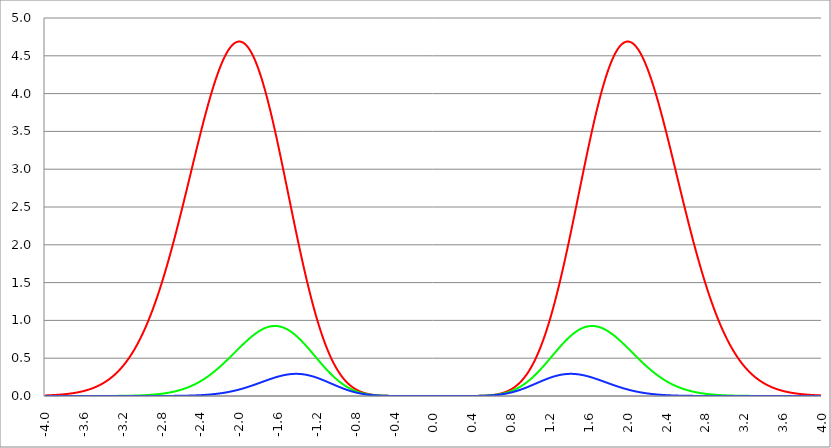
| Category | Series 1 | Series 0 | Series 2 |
|---|---|---|---|
| -4.0 | 0.007 | 0 | 0 |
| -3.996 | 0.008 | 0 | 0 |
| -3.992 | 0.008 | 0 | 0 |
| -3.988 | 0.008 | 0 | 0 |
| -3.984 | 0.008 | 0 | 0 |
| -3.98 | 0.008 | 0 | 0 |
| -3.976 | 0.009 | 0 | 0 |
| -3.972 | 0.009 | 0 | 0 |
| -3.968 | 0.009 | 0 | 0 |
| -3.964 | 0.009 | 0 | 0 |
| -3.96 | 0.009 | 0 | 0 |
| -3.956 | 0.01 | 0 | 0 |
| -3.952 | 0.01 | 0 | 0 |
| -3.948 | 0.01 | 0 | 0 |
| -3.944 | 0.01 | 0 | 0 |
| -3.94 | 0.011 | 0 | 0 |
| -3.936 | 0.011 | 0 | 0 |
| -3.932 | 0.011 | 0 | 0 |
| -3.928 | 0.011 | 0 | 0 |
| -3.924 | 0.012 | 0 | 0 |
| -3.92 | 0.012 | 0 | 0 |
| -3.916 | 0.012 | 0 | 0 |
| -3.912 | 0.012 | 0 | 0 |
| -3.908 | 0.013 | 0 | 0 |
| -3.904 | 0.013 | 0 | 0 |
| -3.9 | 0.013 | 0 | 0 |
| -3.896 | 0.014 | 0 | 0 |
| -3.892 | 0.014 | 0 | 0 |
| -3.888 | 0.014 | 0 | 0 |
| -3.884 | 0.015 | 0 | 0 |
| -3.88 | 0.015 | 0 | 0 |
| -3.876 | 0.015 | 0 | 0 |
| -3.872 | 0.016 | 0 | 0 |
| -3.868 | 0.016 | 0 | 0 |
| -3.864 | 0.016 | 0 | 0 |
| -3.86 | 0.017 | 0 | 0 |
| -3.856 | 0.017 | 0 | 0 |
| -3.852 | 0.017 | 0 | 0 |
| -3.848 | 0.018 | 0 | 0 |
| -3.844 | 0.018 | 0 | 0 |
| -3.84 | 0.019 | 0 | 0 |
| -3.836 | 0.019 | 0 | 0 |
| -3.832 | 0.02 | 0 | 0 |
| -3.828 | 0.02 | 0 | 0 |
| -3.824 | 0.02 | 0 | 0 |
| -3.82 | 0.021 | 0 | 0 |
| -3.816 | 0.021 | 0 | 0 |
| -3.812 | 0.022 | 0 | 0 |
| -3.808 | 0.022 | 0 | 0 |
| -3.804 | 0.023 | 0 | 0 |
| -3.8 | 0.023 | 0 | 0 |
| -3.796 | 0.024 | 0 | 0 |
| -3.792 | 0.024 | 0 | 0 |
| -3.788 | 0.025 | 0 | 0 |
| -3.784 | 0.025 | 0 | 0 |
| -3.78 | 0.026 | 0 | 0 |
| -3.776 | 0.027 | 0 | 0 |
| -3.772 | 0.027 | 0 | 0 |
| -3.768 | 0.028 | 0 | 0 |
| -3.764 | 0.028 | 0 | 0 |
| -3.76 | 0.029 | 0 | 0 |
| -3.756 | 0.03 | 0 | 0 |
| -3.752 | 0.03 | 0 | 0 |
| -3.748 | 0.031 | 0 | 0 |
| -3.744 | 0.032 | 0 | 0 |
| -3.74 | 0.032 | 0 | 0 |
| -3.736 | 0.033 | 0 | 0 |
| -3.732 | 0.034 | 0 | 0 |
| -3.728 | 0.034 | 0 | 0 |
| -3.724 | 0.035 | 0 | 0 |
| -3.72 | 0.036 | 0 | 0 |
| -3.716 | 0.037 | 0 | 0 |
| -3.712 | 0.037 | 0 | 0 |
| -3.708 | 0.038 | 0 | 0 |
| -3.704 | 0.039 | 0 | 0 |
| -3.7 | 0.04 | 0 | 0 |
| -3.696 | 0.041 | 0 | 0 |
| -3.692 | 0.042 | 0 | 0 |
| -3.688 | 0.042 | 0 | 0 |
| -3.684 | 0.043 | 0 | 0 |
| -3.68 | 0.044 | 0 | 0 |
| -3.676 | 0.045 | 0 | 0 |
| -3.672 | 0.046 | 0 | 0 |
| -3.668 | 0.047 | 0 | 0 |
| -3.664 | 0.048 | 0 | 0 |
| -3.66 | 0.049 | 0 | 0 |
| -3.656 | 0.05 | 0 | 0 |
| -3.652 | 0.051 | 0 | 0 |
| -3.648 | 0.052 | 0 | 0 |
| -3.644 | 0.053 | 0 | 0 |
| -3.64 | 0.054 | 0 | 0 |
| -3.636 | 0.055 | 0 | 0 |
| -3.632 | 0.057 | 0 | 0 |
| -3.628 | 0.058 | 0 | 0 |
| -3.624 | 0.059 | 0 | 0 |
| -3.62 | 0.06 | 0 | 0 |
| -3.616 | 0.061 | 0 | 0 |
| -3.612 | 0.063 | 0 | 0 |
| -3.608 | 0.064 | 0 | 0 |
| -3.604 | 0.065 | 0 | 0 |
| -3.6 | 0.066 | 0 | 0 |
| -3.596 | 0.068 | 0 | 0 |
| -3.592 | 0.069 | 0 | 0 |
| -3.588 | 0.07 | 0 | 0 |
| -3.584 | 0.072 | 0 | 0 |
| -3.58 | 0.073 | 0 | 0 |
| -3.576 | 0.075 | 0 | 0 |
| -3.572 | 0.076 | 0 | 0 |
| -3.568 | 0.078 | 0 | 0 |
| -3.564 | 0.079 | 0 | 0 |
| -3.56 | 0.081 | 0 | 0 |
| -3.556 | 0.082 | 0 | 0 |
| -3.552 | 0.084 | 0 | 0 |
| -3.548 | 0.086 | 0 | 0 |
| -3.544 | 0.087 | 0 | 0 |
| -3.54 | 0.089 | 0 | 0 |
| -3.536 | 0.091 | 0 | 0 |
| -3.532 | 0.093 | 0 | 0 |
| -3.528 | 0.094 | 0 | 0 |
| -3.524 | 0.096 | 0 | 0 |
| -3.52 | 0.098 | 0 | 0 |
| -3.516 | 0.1 | 0 | 0 |
| -3.512 | 0.102 | 0 | 0 |
| -3.508 | 0.104 | 0 | 0 |
| -3.504 | 0.106 | 0 | 0 |
| -3.5 | 0.108 | 0 | 0 |
| -3.496 | 0.11 | 0 | 0 |
| -3.492 | 0.112 | 0 | 0 |
| -3.488 | 0.114 | 0 | 0 |
| -3.484 | 0.116 | 0 | 0 |
| -3.48 | 0.118 | 0 | 0 |
| -3.476 | 0.121 | 0 | 0 |
| -3.472 | 0.123 | 0 | 0 |
| -3.467999999999999 | 0.125 | 0 | 0 |
| -3.463999999999999 | 0.127 | 0 | 0 |
| -3.459999999999999 | 0.13 | 0 | 0 |
| -3.455999999999999 | 0.132 | 0 | 0 |
| -3.451999999999999 | 0.135 | 0 | 0 |
| -3.447999999999999 | 0.137 | 0 | 0 |
| -3.443999999999999 | 0.14 | 0 | 0 |
| -3.439999999999999 | 0.142 | 0 | 0 |
| -3.435999999999999 | 0.145 | 0 | 0 |
| -3.431999999999999 | 0.148 | 0 | 0 |
| -3.427999999999999 | 0.15 | 0 | 0 |
| -3.423999999999999 | 0.153 | 0 | 0 |
| -3.419999999999999 | 0.156 | 0 | 0 |
| -3.415999999999999 | 0.159 | 0 | 0 |
| -3.411999999999999 | 0.161 | 0 | 0 |
| -3.407999999999999 | 0.164 | 0 | 0 |
| -3.403999999999999 | 0.167 | 0.001 | 0 |
| -3.399999999999999 | 0.17 | 0.001 | 0 |
| -3.395999999999999 | 0.173 | 0.001 | 0 |
| -3.391999999999999 | 0.177 | 0.001 | 0 |
| -3.387999999999999 | 0.18 | 0.001 | 0 |
| -3.383999999999999 | 0.183 | 0.001 | 0 |
| -3.379999999999999 | 0.186 | 0.001 | 0 |
| -3.375999999999999 | 0.189 | 0.001 | 0 |
| -3.371999999999999 | 0.193 | 0.001 | 0 |
| -3.367999999999999 | 0.196 | 0.001 | 0 |
| -3.363999999999999 | 0.2 | 0.001 | 0 |
| -3.359999999999999 | 0.203 | 0.001 | 0 |
| -3.355999999999999 | 0.207 | 0.001 | 0 |
| -3.351999999999999 | 0.21 | 0.001 | 0 |
| -3.347999999999999 | 0.214 | 0.001 | 0 |
| -3.343999999999999 | 0.218 | 0.001 | 0 |
| -3.339999999999999 | 0.221 | 0.001 | 0 |
| -3.335999999999999 | 0.225 | 0.001 | 0 |
| -3.331999999999999 | 0.229 | 0.001 | 0 |
| -3.327999999999999 | 0.233 | 0.001 | 0 |
| -3.323999999999999 | 0.237 | 0.001 | 0 |
| -3.319999999999999 | 0.241 | 0.001 | 0 |
| -3.315999999999999 | 0.245 | 0.001 | 0 |
| -3.311999999999999 | 0.249 | 0.001 | 0 |
| -3.307999999999999 | 0.254 | 0.001 | 0 |
| -3.303999999999999 | 0.258 | 0.001 | 0 |
| -3.299999999999999 | 0.262 | 0.001 | 0 |
| -3.295999999999999 | 0.267 | 0.001 | 0 |
| -3.291999999999999 | 0.271 | 0.001 | 0 |
| -3.288 | 0.276 | 0.001 | 0 |
| -3.284 | 0.28 | 0.001 | 0 |
| -3.279999999999999 | 0.285 | 0.001 | 0 |
| -3.275999999999999 | 0.29 | 0.001 | 0 |
| -3.271999999999999 | 0.294 | 0.001 | 0 |
| -3.268 | 0.299 | 0.001 | 0 |
| -3.264 | 0.304 | 0.001 | 0 |
| -3.259999999999999 | 0.309 | 0.002 | 0 |
| -3.255999999999999 | 0.314 | 0.002 | 0 |
| -3.251999999999999 | 0.319 | 0.002 | 0 |
| -3.248 | 0.325 | 0.002 | 0 |
| -3.244 | 0.33 | 0.002 | 0 |
| -3.239999999999999 | 0.335 | 0.002 | 0 |
| -3.235999999999999 | 0.341 | 0.002 | 0 |
| -3.231999999999999 | 0.346 | 0.002 | 0 |
| -3.228 | 0.352 | 0.002 | 0 |
| -3.224 | 0.357 | 0.002 | 0 |
| -3.219999999999999 | 0.363 | 0.002 | 0 |
| -3.215999999999999 | 0.369 | 0.002 | 0 |
| -3.211999999999999 | 0.375 | 0.002 | 0 |
| -3.208 | 0.381 | 0.002 | 0 |
| -3.204 | 0.387 | 0.002 | 0 |
| -3.199999999999999 | 0.393 | 0.002 | 0 |
| -3.195999999999999 | 0.399 | 0.002 | 0 |
| -3.191999999999999 | 0.405 | 0.002 | 0 |
| -3.188 | 0.411 | 0.003 | 0 |
| -3.184 | 0.418 | 0.003 | 0 |
| -3.179999999999999 | 0.424 | 0.003 | 0 |
| -3.175999999999999 | 0.431 | 0.003 | 0 |
| -3.171999999999999 | 0.437 | 0.003 | 0 |
| -3.168 | 0.444 | 0.003 | 0 |
| -3.164 | 0.451 | 0.003 | 0 |
| -3.159999999999999 | 0.458 | 0.003 | 0 |
| -3.155999999999999 | 0.465 | 0.003 | 0 |
| -3.151999999999999 | 0.472 | 0.003 | 0 |
| -3.148 | 0.479 | 0.003 | 0 |
| -3.144 | 0.486 | 0.003 | 0 |
| -3.139999999999999 | 0.494 | 0.004 | 0 |
| -3.135999999999999 | 0.501 | 0.004 | 0 |
| -3.131999999999999 | 0.509 | 0.004 | 0 |
| -3.128 | 0.516 | 0.004 | 0 |
| -3.124 | 0.524 | 0.004 | 0 |
| -3.119999999999999 | 0.532 | 0.004 | 0 |
| -3.115999999999999 | 0.54 | 0.004 | 0 |
| -3.111999999999999 | 0.547 | 0.004 | 0 |
| -3.108 | 0.556 | 0.004 | 0 |
| -3.104 | 0.564 | 0.005 | 0 |
| -3.099999999999999 | 0.572 | 0.005 | 0 |
| -3.095999999999999 | 0.58 | 0.005 | 0 |
| -3.091999999999999 | 0.589 | 0.005 | 0 |
| -3.088 | 0.597 | 0.005 | 0 |
| -3.084 | 0.606 | 0.005 | 0 |
| -3.079999999999999 | 0.614 | 0.005 | 0 |
| -3.075999999999999 | 0.623 | 0.005 | 0 |
| -3.071999999999999 | 0.632 | 0.006 | 0 |
| -3.068 | 0.641 | 0.006 | 0 |
| -3.064 | 0.65 | 0.006 | 0 |
| -3.059999999999999 | 0.659 | 0.006 | 0 |
| -3.055999999999999 | 0.669 | 0.006 | 0 |
| -3.051999999999999 | 0.678 | 0.006 | 0 |
| -3.048 | 0.688 | 0.007 | 0 |
| -3.044 | 0.697 | 0.007 | 0 |
| -3.039999999999999 | 0.707 | 0.007 | 0 |
| -3.035999999999999 | 0.717 | 0.007 | 0 |
| -3.031999999999999 | 0.727 | 0.007 | 0 |
| -3.028 | 0.737 | 0.008 | 0 |
| -3.024 | 0.747 | 0.008 | 0 |
| -3.019999999999999 | 0.757 | 0.008 | 0 |
| -3.015999999999999 | 0.767 | 0.008 | 0 |
| -3.011999999999999 | 0.778 | 0.008 | 0 |
| -3.008 | 0.788 | 0.009 | 0 |
| -3.004 | 0.799 | 0.009 | 0 |
| -2.999999999999999 | 0.81 | 0.009 | 0 |
| -2.995999999999999 | 0.821 | 0.009 | 0 |
| -2.991999999999999 | 0.831 | 0.009 | 0 |
| -2.988 | 0.843 | 0.01 | 0 |
| -2.984 | 0.854 | 0.01 | 0 |
| -2.979999999999999 | 0.865 | 0.01 | 0 |
| -2.975999999999999 | 0.876 | 0.01 | 0 |
| -2.971999999999999 | 0.888 | 0.011 | 0 |
| -2.968 | 0.899 | 0.011 | 0 |
| -2.964 | 0.911 | 0.011 | 0 |
| -2.959999999999999 | 0.923 | 0.012 | 0 |
| -2.955999999999999 | 0.935 | 0.012 | 0 |
| -2.951999999999999 | 0.947 | 0.012 | 0 |
| -2.948 | 0.959 | 0.012 | 0 |
| -2.944 | 0.971 | 0.013 | 0 |
| -2.939999999999999 | 0.984 | 0.013 | 0 |
| -2.935999999999999 | 0.996 | 0.013 | 0 |
| -2.931999999999999 | 1.009 | 0.014 | 0 |
| -2.928 | 1.022 | 0.014 | 0 |
| -2.924 | 1.034 | 0.014 | 0 |
| -2.919999999999999 | 1.047 | 0.015 | 0 |
| -2.915999999999999 | 1.06 | 0.015 | 0 |
| -2.911999999999999 | 1.074 | 0.015 | 0 |
| -2.908 | 1.087 | 0.016 | 0 |
| -2.904 | 1.1 | 0.016 | 0 |
| -2.899999999999999 | 1.114 | 0.017 | 0 |
| -2.895999999999999 | 1.127 | 0.017 | 0 |
| -2.891999999999999 | 1.141 | 0.017 | 0 |
| -2.887999999999999 | 1.155 | 0.018 | 0 |
| -2.883999999999999 | 1.169 | 0.018 | 0 |
| -2.879999999999999 | 1.183 | 0.019 | 0 |
| -2.875999999999999 | 1.197 | 0.019 | 0 |
| -2.871999999999999 | 1.211 | 0.02 | 0 |
| -2.867999999999999 | 1.226 | 0.02 | 0 |
| -2.863999999999999 | 1.24 | 0.021 | 0 |
| -2.859999999999999 | 1.255 | 0.021 | 0 |
| -2.855999999999999 | 1.27 | 0.021 | 0 |
| -2.851999999999999 | 1.284 | 0.022 | 0 |
| -2.847999999999999 | 1.299 | 0.023 | 0 |
| -2.843999999999999 | 1.314 | 0.023 | 0 |
| -2.839999999999999 | 1.33 | 0.024 | 0 |
| -2.835999999999999 | 1.345 | 0.024 | 0 |
| -2.831999999999999 | 1.36 | 0.025 | 0 |
| -2.827999999999999 | 1.376 | 0.025 | 0 |
| -2.823999999999999 | 1.391 | 0.026 | 0 |
| -2.819999999999999 | 1.407 | 0.026 | 0 |
| -2.815999999999999 | 1.423 | 0.027 | 0.001 |
| -2.811999999999999 | 1.439 | 0.028 | 0.001 |
| -2.807999999999999 | 1.455 | 0.028 | 0.001 |
| -2.803999999999999 | 1.471 | 0.029 | 0.001 |
| -2.799999999999999 | 1.487 | 0.03 | 0.001 |
| -2.795999999999999 | 1.504 | 0.03 | 0.001 |
| -2.791999999999999 | 1.52 | 0.031 | 0.001 |
| -2.787999999999999 | 1.537 | 0.032 | 0.001 |
| -2.783999999999999 | 1.553 | 0.032 | 0.001 |
| -2.779999999999999 | 1.57 | 0.033 | 0.001 |
| -2.775999999999999 | 1.587 | 0.034 | 0.001 |
| -2.771999999999999 | 1.604 | 0.034 | 0.001 |
| -2.767999999999999 | 1.621 | 0.035 | 0.001 |
| -2.763999999999999 | 1.638 | 0.036 | 0.001 |
| -2.759999999999999 | 1.656 | 0.037 | 0.001 |
| -2.755999999999999 | 1.673 | 0.038 | 0.001 |
| -2.751999999999999 | 1.691 | 0.038 | 0.001 |
| -2.747999999999999 | 1.708 | 0.039 | 0.001 |
| -2.743999999999999 | 1.726 | 0.04 | 0.001 |
| -2.739999999999999 | 1.744 | 0.041 | 0.001 |
| -2.735999999999999 | 1.762 | 0.042 | 0.001 |
| -2.731999999999999 | 1.78 | 0.043 | 0.001 |
| -2.727999999999999 | 1.798 | 0.044 | 0.001 |
| -2.723999999999999 | 1.816 | 0.044 | 0.001 |
| -2.719999999999999 | 1.834 | 0.045 | 0.001 |
| -2.715999999999999 | 1.853 | 0.046 | 0.001 |
| -2.711999999999999 | 1.871 | 0.047 | 0.001 |
| -2.707999999999999 | 1.89 | 0.048 | 0.001 |
| -2.703999999999999 | 1.908 | 0.049 | 0.001 |
| -2.699999999999999 | 1.927 | 0.05 | 0.001 |
| -2.695999999999999 | 1.946 | 0.051 | 0.001 |
| -2.691999999999999 | 1.965 | 0.052 | 0.001 |
| -2.687999999999999 | 1.984 | 0.054 | 0.001 |
| -2.683999999999999 | 2.003 | 0.055 | 0.001 |
| -2.679999999999999 | 2.022 | 0.056 | 0.002 |
| -2.675999999999999 | 2.041 | 0.057 | 0.002 |
| -2.671999999999999 | 2.061 | 0.058 | 0.002 |
| -2.667999999999999 | 2.08 | 0.059 | 0.002 |
| -2.663999999999999 | 2.1 | 0.06 | 0.002 |
| -2.659999999999999 | 2.119 | 0.062 | 0.002 |
| -2.655999999999999 | 2.139 | 0.063 | 0.002 |
| -2.651999999999999 | 2.158 | 0.064 | 0.002 |
| -2.647999999999999 | 2.178 | 0.065 | 0.002 |
| -2.643999999999999 | 2.198 | 0.067 | 0.002 |
| -2.639999999999999 | 2.218 | 0.068 | 0.002 |
| -2.635999999999999 | 2.238 | 0.069 | 0.002 |
| -2.631999999999999 | 2.258 | 0.071 | 0.002 |
| -2.627999999999999 | 2.278 | 0.072 | 0.002 |
| -2.623999999999999 | 2.298 | 0.074 | 0.002 |
| -2.619999999999999 | 2.319 | 0.075 | 0.002 |
| -2.615999999999999 | 2.339 | 0.076 | 0.002 |
| -2.611999999999999 | 2.359 | 0.078 | 0.003 |
| -2.607999999999999 | 2.38 | 0.079 | 0.003 |
| -2.603999999999999 | 2.4 | 0.081 | 0.003 |
| -2.599999999999999 | 2.421 | 0.082 | 0.003 |
| -2.595999999999999 | 2.441 | 0.084 | 0.003 |
| -2.591999999999999 | 2.462 | 0.086 | 0.003 |
| -2.587999999999999 | 2.483 | 0.087 | 0.003 |
| -2.583999999999999 | 2.503 | 0.089 | 0.003 |
| -2.579999999999999 | 2.524 | 0.091 | 0.003 |
| -2.575999999999999 | 2.545 | 0.092 | 0.003 |
| -2.571999999999999 | 2.566 | 0.094 | 0.003 |
| -2.567999999999999 | 2.587 | 0.096 | 0.004 |
| -2.563999999999999 | 2.608 | 0.097 | 0.004 |
| -2.559999999999999 | 2.629 | 0.099 | 0.004 |
| -2.555999999999999 | 2.65 | 0.101 | 0.004 |
| -2.551999999999999 | 2.671 | 0.103 | 0.004 |
| -2.547999999999999 | 2.692 | 0.105 | 0.004 |
| -2.543999999999999 | 2.713 | 0.107 | 0.004 |
| -2.539999999999999 | 2.734 | 0.109 | 0.004 |
| -2.535999999999999 | 2.755 | 0.111 | 0.004 |
| -2.531999999999999 | 2.776 | 0.113 | 0.005 |
| -2.527999999999999 | 2.797 | 0.115 | 0.005 |
| -2.523999999999999 | 2.818 | 0.117 | 0.005 |
| -2.519999999999999 | 2.84 | 0.119 | 0.005 |
| -2.515999999999999 | 2.861 | 0.121 | 0.005 |
| -2.511999999999999 | 2.882 | 0.123 | 0.005 |
| -2.507999999999999 | 2.903 | 0.125 | 0.005 |
| -2.503999999999999 | 2.924 | 0.127 | 0.006 |
| -2.499999999999999 | 2.946 | 0.129 | 0.006 |
| -2.495999999999999 | 2.967 | 0.132 | 0.006 |
| -2.491999999999999 | 2.988 | 0.134 | 0.006 |
| -2.487999999999999 | 3.009 | 0.136 | 0.006 |
| -2.483999999999999 | 3.03 | 0.139 | 0.006 |
| -2.479999999999999 | 3.052 | 0.141 | 0.007 |
| -2.475999999999999 | 3.073 | 0.143 | 0.007 |
| -2.471999999999999 | 3.094 | 0.146 | 0.007 |
| -2.467999999999999 | 3.115 | 0.148 | 0.007 |
| -2.463999999999999 | 3.136 | 0.151 | 0.007 |
| -2.459999999999999 | 3.157 | 0.153 | 0.007 |
| -2.455999999999999 | 3.178 | 0.156 | 0.008 |
| -2.451999999999999 | 3.199 | 0.158 | 0.008 |
| -2.447999999999999 | 3.22 | 0.161 | 0.008 |
| -2.443999999999999 | 3.241 | 0.164 | 0.008 |
| -2.439999999999999 | 3.262 | 0.166 | 0.008 |
| -2.435999999999999 | 3.283 | 0.169 | 0.009 |
| -2.431999999999999 | 3.304 | 0.172 | 0.009 |
| -2.427999999999999 | 3.325 | 0.174 | 0.009 |
| -2.423999999999999 | 3.345 | 0.177 | 0.009 |
| -2.419999999999999 | 3.366 | 0.18 | 0.01 |
| -2.415999999999999 | 3.387 | 0.183 | 0.01 |
| -2.411999999999999 | 3.407 | 0.186 | 0.01 |
| -2.407999999999999 | 3.428 | 0.189 | 0.01 |
| -2.403999999999999 | 3.448 | 0.192 | 0.011 |
| -2.399999999999999 | 3.469 | 0.195 | 0.011 |
| -2.395999999999999 | 3.489 | 0.198 | 0.011 |
| -2.391999999999999 | 3.509 | 0.201 | 0.011 |
| -2.387999999999999 | 3.529 | 0.204 | 0.012 |
| -2.383999999999999 | 3.549 | 0.207 | 0.012 |
| -2.379999999999999 | 3.569 | 0.21 | 0.012 |
| -2.375999999999999 | 3.589 | 0.213 | 0.013 |
| -2.371999999999999 | 3.609 | 0.217 | 0.013 |
| -2.367999999999998 | 3.629 | 0.22 | 0.013 |
| -2.363999999999998 | 3.649 | 0.223 | 0.014 |
| -2.359999999999998 | 3.668 | 0.226 | 0.014 |
| -2.355999999999998 | 3.688 | 0.23 | 0.014 |
| -2.351999999999998 | 3.707 | 0.233 | 0.015 |
| -2.347999999999998 | 3.726 | 0.237 | 0.015 |
| -2.343999999999998 | 3.745 | 0.24 | 0.015 |
| -2.339999999999998 | 3.764 | 0.244 | 0.016 |
| -2.335999999999998 | 3.783 | 0.247 | 0.016 |
| -2.331999999999998 | 3.802 | 0.251 | 0.017 |
| -2.327999999999998 | 3.821 | 0.254 | 0.017 |
| -2.323999999999998 | 3.84 | 0.258 | 0.017 |
| -2.319999999999998 | 3.858 | 0.262 | 0.018 |
| -2.315999999999998 | 3.876 | 0.265 | 0.018 |
| -2.311999999999998 | 3.894 | 0.269 | 0.019 |
| -2.307999999999998 | 3.913 | 0.273 | 0.019 |
| -2.303999999999998 | 3.93 | 0.277 | 0.019 |
| -2.299999999999998 | 3.948 | 0.28 | 0.02 |
| -2.295999999999998 | 3.966 | 0.284 | 0.02 |
| -2.291999999999998 | 3.983 | 0.288 | 0.021 |
| -2.287999999999998 | 4.001 | 0.292 | 0.021 |
| -2.283999999999998 | 4.018 | 0.296 | 0.022 |
| -2.279999999999998 | 4.035 | 0.3 | 0.022 |
| -2.275999999999998 | 4.052 | 0.304 | 0.023 |
| -2.271999999999998 | 4.069 | 0.308 | 0.023 |
| -2.267999999999998 | 4.085 | 0.312 | 0.024 |
| -2.263999999999998 | 4.102 | 0.316 | 0.024 |
| -2.259999999999998 | 4.118 | 0.32 | 0.025 |
| -2.255999999999998 | 4.134 | 0.324 | 0.025 |
| -2.251999999999998 | 4.15 | 0.329 | 0.026 |
| -2.247999999999998 | 4.165 | 0.333 | 0.027 |
| -2.243999999999998 | 4.181 | 0.337 | 0.027 |
| -2.239999999999998 | 4.196 | 0.341 | 0.028 |
| -2.235999999999998 | 4.211 | 0.346 | 0.028 |
| -2.231999999999998 | 4.226 | 0.35 | 0.029 |
| -2.227999999999998 | 4.241 | 0.354 | 0.03 |
| -2.223999999999998 | 4.256 | 0.359 | 0.03 |
| -2.219999999999998 | 4.27 | 0.363 | 0.031 |
| -2.215999999999998 | 4.284 | 0.368 | 0.032 |
| -2.211999999999998 | 4.298 | 0.372 | 0.032 |
| -2.207999999999998 | 4.312 | 0.377 | 0.033 |
| -2.203999999999998 | 4.326 | 0.381 | 0.034 |
| -2.199999999999998 | 4.339 | 0.386 | 0.034 |
| -2.195999999999998 | 4.352 | 0.39 | 0.035 |
| -2.191999999999998 | 4.365 | 0.395 | 0.036 |
| -2.187999999999998 | 4.378 | 0.4 | 0.036 |
| -2.183999999999998 | 4.39 | 0.404 | 0.037 |
| -2.179999999999998 | 4.403 | 0.409 | 0.038 |
| -2.175999999999998 | 4.415 | 0.414 | 0.039 |
| -2.171999999999998 | 4.426 | 0.418 | 0.04 |
| -2.167999999999998 | 4.438 | 0.423 | 0.04 |
| -2.163999999999998 | 4.449 | 0.428 | 0.041 |
| -2.159999999999998 | 4.461 | 0.433 | 0.042 |
| -2.155999999999998 | 4.471 | 0.438 | 0.043 |
| -2.151999999999998 | 4.482 | 0.442 | 0.044 |
| -2.147999999999998 | 4.492 | 0.447 | 0.045 |
| -2.143999999999998 | 4.503 | 0.452 | 0.045 |
| -2.139999999999998 | 4.512 | 0.457 | 0.046 |
| -2.135999999999998 | 4.522 | 0.462 | 0.047 |
| -2.131999999999998 | 4.532 | 0.467 | 0.048 |
| -2.127999999999998 | 4.541 | 0.472 | 0.049 |
| -2.123999999999998 | 4.55 | 0.477 | 0.05 |
| -2.119999999999998 | 4.558 | 0.482 | 0.051 |
| -2.115999999999998 | 4.567 | 0.487 | 0.052 |
| -2.111999999999998 | 4.575 | 0.492 | 0.053 |
| -2.107999999999998 | 4.583 | 0.497 | 0.054 |
| -2.103999999999998 | 4.59 | 0.502 | 0.055 |
| -2.099999999999998 | 4.597 | 0.507 | 0.056 |
| -2.095999999999998 | 4.604 | 0.512 | 0.057 |
| -2.091999999999998 | 4.611 | 0.517 | 0.058 |
| -2.087999999999998 | 4.618 | 0.522 | 0.059 |
| -2.083999999999998 | 4.624 | 0.527 | 0.06 |
| -2.079999999999998 | 4.63 | 0.532 | 0.061 |
| -2.075999999999998 | 4.636 | 0.537 | 0.062 |
| -2.071999999999998 | 4.641 | 0.542 | 0.063 |
| -2.067999999999998 | 4.646 | 0.548 | 0.065 |
| -2.063999999999998 | 4.651 | 0.553 | 0.066 |
| -2.059999999999998 | 4.655 | 0.558 | 0.067 |
| -2.055999999999998 | 4.66 | 0.563 | 0.068 |
| -2.051999999999998 | 4.664 | 0.568 | 0.069 |
| -2.047999999999998 | 4.667 | 0.573 | 0.07 |
| -2.043999999999998 | 4.671 | 0.578 | 0.072 |
| -2.039999999999998 | 4.674 | 0.583 | 0.073 |
| -2.035999999999998 | 4.677 | 0.589 | 0.074 |
| -2.031999999999998 | 4.679 | 0.594 | 0.075 |
| -2.027999999999998 | 4.681 | 0.599 | 0.077 |
| -2.023999999999998 | 4.683 | 0.604 | 0.078 |
| -2.019999999999998 | 4.685 | 0.609 | 0.079 |
| -2.015999999999998 | 4.686 | 0.614 | 0.08 |
| -2.011999999999998 | 4.687 | 0.619 | 0.082 |
| -2.007999999999998 | 4.688 | 0.624 | 0.083 |
| -2.003999999999998 | 4.689 | 0.629 | 0.085 |
| -1.999999999999998 | 4.689 | 0.635 | 0.086 |
| -1.995999999999998 | 4.689 | 0.64 | 0.087 |
| -1.991999999999998 | 4.688 | 0.645 | 0.089 |
| -1.987999999999998 | 4.687 | 0.65 | 0.09 |
| -1.983999999999998 | 4.686 | 0.655 | 0.091 |
| -1.979999999999998 | 4.685 | 0.66 | 0.093 |
| -1.975999999999998 | 4.683 | 0.665 | 0.094 |
| -1.971999999999998 | 4.681 | 0.67 | 0.096 |
| -1.967999999999998 | 4.679 | 0.675 | 0.097 |
| -1.963999999999998 | 4.677 | 0.68 | 0.099 |
| -1.959999999999998 | 4.674 | 0.685 | 0.1 |
| -1.955999999999998 | 4.671 | 0.69 | 0.102 |
| -1.951999999999998 | 4.667 | 0.694 | 0.103 |
| -1.947999999999998 | 4.663 | 0.699 | 0.105 |
| -1.943999999999998 | 4.659 | 0.704 | 0.106 |
| -1.939999999999998 | 4.655 | 0.709 | 0.108 |
| -1.935999999999998 | 4.65 | 0.714 | 0.11 |
| -1.931999999999998 | 4.645 | 0.719 | 0.111 |
| -1.927999999999998 | 4.64 | 0.723 | 0.113 |
| -1.923999999999998 | 4.634 | 0.728 | 0.114 |
| -1.919999999999998 | 4.628 | 0.733 | 0.116 |
| -1.915999999999998 | 4.622 | 0.737 | 0.118 |
| -1.911999999999998 | 4.616 | 0.742 | 0.119 |
| -1.907999999999998 | 4.609 | 0.747 | 0.121 |
| -1.903999999999998 | 4.602 | 0.751 | 0.123 |
| -1.899999999999998 | 4.594 | 0.756 | 0.124 |
| -1.895999999999998 | 4.587 | 0.76 | 0.126 |
| -1.891999999999998 | 4.579 | 0.765 | 0.128 |
| -1.887999999999998 | 4.57 | 0.769 | 0.129 |
| -1.883999999999998 | 4.562 | 0.773 | 0.131 |
| -1.879999999999998 | 4.553 | 0.778 | 0.133 |
| -1.875999999999998 | 4.544 | 0.782 | 0.135 |
| -1.871999999999998 | 4.534 | 0.786 | 0.136 |
| -1.867999999999998 | 4.525 | 0.79 | 0.138 |
| -1.863999999999998 | 4.515 | 0.795 | 0.14 |
| -1.859999999999998 | 4.504 | 0.799 | 0.142 |
| -1.855999999999998 | 4.494 | 0.803 | 0.143 |
| -1.851999999999998 | 4.483 | 0.807 | 0.145 |
| -1.847999999999998 | 4.472 | 0.811 | 0.147 |
| -1.843999999999998 | 4.46 | 0.815 | 0.149 |
| -1.839999999999998 | 4.448 | 0.819 | 0.151 |
| -1.835999999999998 | 4.436 | 0.822 | 0.152 |
| -1.831999999999998 | 4.424 | 0.826 | 0.154 |
| -1.827999999999998 | 4.411 | 0.83 | 0.156 |
| -1.823999999999998 | 4.399 | 0.833 | 0.158 |
| -1.819999999999998 | 4.385 | 0.837 | 0.16 |
| -1.815999999999998 | 4.372 | 0.841 | 0.162 |
| -1.811999999999998 | 4.358 | 0.844 | 0.163 |
| -1.807999999999998 | 4.344 | 0.847 | 0.165 |
| -1.803999999999998 | 4.33 | 0.851 | 0.167 |
| -1.799999999999998 | 4.316 | 0.854 | 0.169 |
| -1.795999999999998 | 4.301 | 0.857 | 0.171 |
| -1.791999999999998 | 4.286 | 0.861 | 0.173 |
| -1.787999999999998 | 4.271 | 0.864 | 0.175 |
| -1.783999999999998 | 4.255 | 0.867 | 0.176 |
| -1.779999999999998 | 4.24 | 0.87 | 0.178 |
| -1.775999999999998 | 4.224 | 0.873 | 0.18 |
| -1.771999999999998 | 4.208 | 0.875 | 0.182 |
| -1.767999999999998 | 4.191 | 0.878 | 0.184 |
| -1.763999999999998 | 4.174 | 0.881 | 0.186 |
| -1.759999999999998 | 4.157 | 0.883 | 0.188 |
| -1.755999999999998 | 4.14 | 0.886 | 0.19 |
| -1.751999999999998 | 4.123 | 0.889 | 0.191 |
| -1.747999999999998 | 4.105 | 0.891 | 0.193 |
| -1.743999999999998 | 4.087 | 0.893 | 0.195 |
| -1.739999999999998 | 4.069 | 0.896 | 0.197 |
| -1.735999999999998 | 4.051 | 0.898 | 0.199 |
| -1.731999999999998 | 4.033 | 0.9 | 0.201 |
| -1.727999999999998 | 4.014 | 0.902 | 0.203 |
| -1.723999999999998 | 3.995 | 0.904 | 0.205 |
| -1.719999999999998 | 3.976 | 0.906 | 0.206 |
| -1.715999999999998 | 3.956 | 0.908 | 0.208 |
| -1.711999999999998 | 3.937 | 0.909 | 0.21 |
| -1.707999999999998 | 3.917 | 0.911 | 0.212 |
| -1.703999999999998 | 3.897 | 0.912 | 0.214 |
| -1.699999999999998 | 3.877 | 0.914 | 0.215 |
| -1.695999999999998 | 3.857 | 0.915 | 0.217 |
| -1.691999999999998 | 3.836 | 0.917 | 0.219 |
| -1.687999999999998 | 3.815 | 0.918 | 0.221 |
| -1.683999999999998 | 3.794 | 0.919 | 0.223 |
| -1.679999999999998 | 3.773 | 0.92 | 0.224 |
| -1.675999999999998 | 3.752 | 0.921 | 0.226 |
| -1.671999999999998 | 3.731 | 0.922 | 0.228 |
| -1.667999999999998 | 3.709 | 0.923 | 0.23 |
| -1.663999999999998 | 3.687 | 0.924 | 0.231 |
| -1.659999999999998 | 3.665 | 0.924 | 0.233 |
| -1.655999999999998 | 3.643 | 0.925 | 0.235 |
| -1.651999999999998 | 3.621 | 0.925 | 0.236 |
| -1.647999999999998 | 3.599 | 0.926 | 0.238 |
| -1.643999999999998 | 3.576 | 0.926 | 0.24 |
| -1.639999999999998 | 3.554 | 0.926 | 0.241 |
| -1.635999999999998 | 3.531 | 0.926 | 0.243 |
| -1.631999999999998 | 3.508 | 0.926 | 0.245 |
| -1.627999999999998 | 3.485 | 0.926 | 0.246 |
| -1.623999999999998 | 3.462 | 0.926 | 0.248 |
| -1.619999999999998 | 3.438 | 0.926 | 0.249 |
| -1.615999999999998 | 3.415 | 0.925 | 0.251 |
| -1.611999999999998 | 3.391 | 0.925 | 0.252 |
| -1.607999999999998 | 3.368 | 0.924 | 0.254 |
| -1.603999999999998 | 3.344 | 0.924 | 0.255 |
| -1.599999999999998 | 3.32 | 0.923 | 0.257 |
| -1.595999999999998 | 3.296 | 0.922 | 0.258 |
| -1.591999999999998 | 3.272 | 0.921 | 0.259 |
| -1.587999999999998 | 3.248 | 0.921 | 0.261 |
| -1.583999999999998 | 3.224 | 0.919 | 0.262 |
| -1.579999999999998 | 3.2 | 0.918 | 0.264 |
| -1.575999999999998 | 3.175 | 0.917 | 0.265 |
| -1.571999999999998 | 3.151 | 0.916 | 0.266 |
| -1.567999999999998 | 3.126 | 0.914 | 0.267 |
| -1.563999999999998 | 3.101 | 0.913 | 0.269 |
| -1.559999999999998 | 3.077 | 0.911 | 0.27 |
| -1.555999999999998 | 3.052 | 0.91 | 0.271 |
| -1.551999999999998 | 3.027 | 0.908 | 0.272 |
| -1.547999999999998 | 3.002 | 0.906 | 0.273 |
| -1.543999999999998 | 2.977 | 0.904 | 0.274 |
| -1.539999999999998 | 2.953 | 0.902 | 0.276 |
| -1.535999999999998 | 2.928 | 0.9 | 0.277 |
| -1.531999999999998 | 2.902 | 0.898 | 0.278 |
| -1.527999999999998 | 2.877 | 0.895 | 0.279 |
| -1.523999999999998 | 2.852 | 0.893 | 0.28 |
| -1.519999999999998 | 2.827 | 0.891 | 0.281 |
| -1.515999999999998 | 2.802 | 0.888 | 0.281 |
| -1.511999999999998 | 2.777 | 0.885 | 0.282 |
| -1.507999999999998 | 2.752 | 0.883 | 0.283 |
| -1.503999999999998 | 2.726 | 0.88 | 0.284 |
| -1.499999999999998 | 2.701 | 0.877 | 0.285 |
| -1.495999999999998 | 2.676 | 0.874 | 0.285 |
| -1.491999999999998 | 2.651 | 0.871 | 0.286 |
| -1.487999999999998 | 2.626 | 0.868 | 0.287 |
| -1.483999999999998 | 2.6 | 0.865 | 0.287 |
| -1.479999999999998 | 2.575 | 0.861 | 0.288 |
| -1.475999999999998 | 2.55 | 0.858 | 0.289 |
| -1.471999999999998 | 2.525 | 0.855 | 0.289 |
| -1.467999999999998 | 2.5 | 0.851 | 0.29 |
| -1.463999999999998 | 2.475 | 0.847 | 0.29 |
| -1.459999999999998 | 2.45 | 0.844 | 0.291 |
| -1.455999999999998 | 2.424 | 0.84 | 0.291 |
| -1.451999999999998 | 2.399 | 0.836 | 0.291 |
| -1.447999999999998 | 2.374 | 0.832 | 0.292 |
| -1.443999999999998 | 2.349 | 0.828 | 0.292 |
| -1.439999999999998 | 2.325 | 0.824 | 0.292 |
| -1.435999999999998 | 2.3 | 0.82 | 0.292 |
| -1.431999999999998 | 2.275 | 0.816 | 0.293 |
| -1.427999999999998 | 2.25 | 0.812 | 0.293 |
| -1.423999999999998 | 2.226 | 0.807 | 0.293 |
| -1.419999999999998 | 2.201 | 0.803 | 0.293 |
| -1.415999999999998 | 2.176 | 0.799 | 0.293 |
| -1.411999999999998 | 2.152 | 0.794 | 0.293 |
| -1.407999999999998 | 2.127 | 0.79 | 0.293 |
| -1.403999999999998 | 2.103 | 0.785 | 0.293 |
| -1.399999999999998 | 2.079 | 0.78 | 0.293 |
| -1.395999999999998 | 2.055 | 0.775 | 0.293 |
| -1.391999999999998 | 2.03 | 0.771 | 0.292 |
| -1.387999999999998 | 2.006 | 0.766 | 0.292 |
| -1.383999999999998 | 1.983 | 0.761 | 0.292 |
| -1.379999999999998 | 1.959 | 0.756 | 0.292 |
| -1.375999999999998 | 1.935 | 0.751 | 0.291 |
| -1.371999999999998 | 1.911 | 0.746 | 0.291 |
| -1.367999999999998 | 1.888 | 0.741 | 0.291 |
| -1.363999999999998 | 1.864 | 0.735 | 0.29 |
| -1.359999999999998 | 1.841 | 0.73 | 0.29 |
| -1.355999999999998 | 1.818 | 0.725 | 0.289 |
| -1.351999999999998 | 1.795 | 0.72 | 0.288 |
| -1.347999999999998 | 1.772 | 0.714 | 0.288 |
| -1.343999999999998 | 1.749 | 0.709 | 0.287 |
| -1.339999999999998 | 1.726 | 0.703 | 0.287 |
| -1.335999999999998 | 1.703 | 0.698 | 0.286 |
| -1.331999999999998 | 1.681 | 0.692 | 0.285 |
| -1.327999999999998 | 1.658 | 0.687 | 0.284 |
| -1.323999999999998 | 1.636 | 0.681 | 0.283 |
| -1.319999999999998 | 1.614 | 0.675 | 0.283 |
| -1.315999999999998 | 1.592 | 0.67 | 0.282 |
| -1.311999999999998 | 1.57 | 0.664 | 0.281 |
| -1.307999999999998 | 1.548 | 0.658 | 0.28 |
| -1.303999999999998 | 1.527 | 0.652 | 0.279 |
| -1.299999999999998 | 1.505 | 0.647 | 0.278 |
| -1.295999999999998 | 1.484 | 0.641 | 0.277 |
| -1.291999999999998 | 1.463 | 0.635 | 0.276 |
| -1.287999999999998 | 1.442 | 0.629 | 0.274 |
| -1.283999999999998 | 1.421 | 0.623 | 0.273 |
| -1.279999999999998 | 1.4 | 0.617 | 0.272 |
| -1.275999999999998 | 1.379 | 0.611 | 0.271 |
| -1.271999999999998 | 1.359 | 0.605 | 0.269 |
| -1.267999999999998 | 1.339 | 0.599 | 0.268 |
| -1.263999999999998 | 1.319 | 0.593 | 0.267 |
| -1.259999999999998 | 1.299 | 0.587 | 0.265 |
| -1.255999999999998 | 1.279 | 0.581 | 0.264 |
| -1.251999999999998 | 1.259 | 0.575 | 0.263 |
| -1.247999999999998 | 1.24 | 0.569 | 0.261 |
| -1.243999999999998 | 1.22 | 0.563 | 0.26 |
| -1.239999999999998 | 1.201 | 0.557 | 0.258 |
| -1.235999999999998 | 1.182 | 0.551 | 0.257 |
| -1.231999999999998 | 1.163 | 0.545 | 0.255 |
| -1.227999999999998 | 1.145 | 0.539 | 0.253 |
| -1.223999999999998 | 1.126 | 0.532 | 0.252 |
| -1.219999999999998 | 1.108 | 0.526 | 0.25 |
| -1.215999999999998 | 1.09 | 0.52 | 0.248 |
| -1.211999999999998 | 1.072 | 0.514 | 0.247 |
| -1.207999999999998 | 1.054 | 0.508 | 0.245 |
| -1.203999999999998 | 1.036 | 0.502 | 0.243 |
| -1.199999999999997 | 1.019 | 0.496 | 0.241 |
| -1.195999999999997 | 1.001 | 0.49 | 0.24 |
| -1.191999999999997 | 0.984 | 0.484 | 0.238 |
| -1.187999999999997 | 0.967 | 0.478 | 0.236 |
| -1.183999999999997 | 0.951 | 0.472 | 0.234 |
| -1.179999999999997 | 0.934 | 0.466 | 0.232 |
| -1.175999999999997 | 0.918 | 0.46 | 0.23 |
| -1.171999999999997 | 0.901 | 0.454 | 0.228 |
| -1.167999999999997 | 0.885 | 0.448 | 0.226 |
| -1.163999999999997 | 0.869 | 0.442 | 0.224 |
| -1.159999999999997 | 0.854 | 0.436 | 0.222 |
| -1.155999999999997 | 0.838 | 0.43 | 0.22 |
| -1.151999999999997 | 0.823 | 0.424 | 0.218 |
| -1.147999999999997 | 0.808 | 0.418 | 0.216 |
| -1.143999999999997 | 0.793 | 0.412 | 0.214 |
| -1.139999999999997 | 0.778 | 0.406 | 0.212 |
| -1.135999999999997 | 0.763 | 0.4 | 0.21 |
| -1.131999999999997 | 0.749 | 0.394 | 0.208 |
| -1.127999999999997 | 0.734 | 0.389 | 0.206 |
| -1.123999999999997 | 0.72 | 0.383 | 0.204 |
| -1.119999999999997 | 0.706 | 0.377 | 0.201 |
| -1.115999999999997 | 0.692 | 0.372 | 0.199 |
| -1.111999999999997 | 0.679 | 0.366 | 0.197 |
| -1.107999999999997 | 0.666 | 0.36 | 0.195 |
| -1.103999999999997 | 0.652 | 0.355 | 0.193 |
| -1.099999999999997 | 0.639 | 0.349 | 0.191 |
| -1.095999999999997 | 0.626 | 0.344 | 0.188 |
| -1.091999999999997 | 0.614 | 0.338 | 0.186 |
| -1.087999999999997 | 0.601 | 0.333 | 0.184 |
| -1.083999999999997 | 0.589 | 0.327 | 0.182 |
| -1.079999999999997 | 0.577 | 0.322 | 0.18 |
| -1.075999999999997 | 0.565 | 0.316 | 0.177 |
| -1.071999999999997 | 0.553 | 0.311 | 0.175 |
| -1.067999999999997 | 0.541 | 0.306 | 0.173 |
| -1.063999999999997 | 0.53 | 0.301 | 0.171 |
| -1.059999999999997 | 0.518 | 0.295 | 0.168 |
| -1.055999999999997 | 0.507 | 0.29 | 0.166 |
| -1.051999999999997 | 0.496 | 0.285 | 0.164 |
| -1.047999999999997 | 0.485 | 0.28 | 0.162 |
| -1.043999999999997 | 0.475 | 0.275 | 0.16 |
| -1.039999999999997 | 0.464 | 0.27 | 0.157 |
| -1.035999999999997 | 0.454 | 0.265 | 0.155 |
| -1.031999999999997 | 0.444 | 0.26 | 0.153 |
| -1.027999999999997 | 0.434 | 0.256 | 0.151 |
| -1.023999999999997 | 0.424 | 0.251 | 0.148 |
| -1.019999999999997 | 0.414 | 0.246 | 0.146 |
| -1.015999999999997 | 0.404 | 0.241 | 0.144 |
| -1.011999999999997 | 0.395 | 0.237 | 0.142 |
| -1.007999999999997 | 0.386 | 0.232 | 0.14 |
| -1.003999999999997 | 0.377 | 0.228 | 0.138 |
| -0.999999999999997 | 0.368 | 0.223 | 0.135 |
| -0.995999999999997 | 0.359 | 0.219 | 0.133 |
| -0.991999999999997 | 0.351 | 0.214 | 0.131 |
| -0.987999999999997 | 0.342 | 0.21 | 0.129 |
| -0.983999999999997 | 0.334 | 0.206 | 0.127 |
| -0.979999999999997 | 0.326 | 0.201 | 0.125 |
| -0.975999999999997 | 0.318 | 0.197 | 0.123 |
| -0.971999999999997 | 0.31 | 0.193 | 0.12 |
| -0.967999999999997 | 0.302 | 0.189 | 0.118 |
| -0.963999999999997 | 0.294 | 0.185 | 0.116 |
| -0.959999999999997 | 0.287 | 0.181 | 0.114 |
| -0.955999999999997 | 0.28 | 0.177 | 0.112 |
| -0.951999999999997 | 0.273 | 0.173 | 0.11 |
| -0.947999999999997 | 0.266 | 0.169 | 0.108 |
| -0.943999999999997 | 0.259 | 0.166 | 0.106 |
| -0.939999999999997 | 0.252 | 0.162 | 0.104 |
| -0.935999999999997 | 0.245 | 0.158 | 0.102 |
| -0.931999999999997 | 0.239 | 0.155 | 0.1 |
| -0.927999999999997 | 0.232 | 0.151 | 0.098 |
| -0.923999999999997 | 0.226 | 0.148 | 0.096 |
| -0.919999999999997 | 0.22 | 0.144 | 0.094 |
| -0.915999999999997 | 0.214 | 0.141 | 0.093 |
| -0.911999999999997 | 0.208 | 0.137 | 0.091 |
| -0.907999999999997 | 0.203 | 0.134 | 0.089 |
| -0.903999999999997 | 0.197 | 0.131 | 0.087 |
| -0.899999999999997 | 0.191 | 0.128 | 0.085 |
| -0.895999999999997 | 0.186 | 0.125 | 0.083 |
| -0.891999999999997 | 0.181 | 0.122 | 0.082 |
| -0.887999999999997 | 0.176 | 0.118 | 0.08 |
| -0.883999999999997 | 0.171 | 0.115 | 0.078 |
| -0.879999999999997 | 0.166 | 0.113 | 0.076 |
| -0.875999999999997 | 0.161 | 0.11 | 0.075 |
| -0.871999999999997 | 0.156 | 0.107 | 0.073 |
| -0.867999999999997 | 0.152 | 0.104 | 0.071 |
| -0.863999999999997 | 0.147 | 0.101 | 0.07 |
| -0.859999999999997 | 0.143 | 0.099 | 0.068 |
| -0.855999999999997 | 0.139 | 0.096 | 0.067 |
| -0.851999999999997 | 0.134 | 0.093 | 0.065 |
| -0.847999999999997 | 0.13 | 0.091 | 0.063 |
| -0.843999999999997 | 0.126 | 0.088 | 0.062 |
| -0.839999999999997 | 0.122 | 0.086 | 0.06 |
| -0.835999999999997 | 0.119 | 0.084 | 0.059 |
| -0.831999999999997 | 0.115 | 0.081 | 0.058 |
| -0.827999999999997 | 0.111 | 0.079 | 0.056 |
| -0.823999999999997 | 0.108 | 0.077 | 0.055 |
| -0.819999999999997 | 0.104 | 0.075 | 0.053 |
| -0.815999999999997 | 0.101 | 0.072 | 0.052 |
| -0.811999999999997 | 0.098 | 0.07 | 0.051 |
| -0.807999999999997 | 0.095 | 0.068 | 0.049 |
| -0.803999999999997 | 0.091 | 0.066 | 0.048 |
| -0.799999999999997 | 0.088 | 0.064 | 0.047 |
| -0.795999999999997 | 0.086 | 0.062 | 0.045 |
| -0.791999999999997 | 0.083 | 0.06 | 0.044 |
| -0.787999999999997 | 0.08 | 0.059 | 0.043 |
| -0.783999999999997 | 0.077 | 0.057 | 0.042 |
| -0.779999999999997 | 0.075 | 0.055 | 0.041 |
| -0.775999999999997 | 0.072 | 0.053 | 0.039 |
| -0.771999999999997 | 0.07 | 0.052 | 0.038 |
| -0.767999999999997 | 0.067 | 0.05 | 0.037 |
| -0.763999999999997 | 0.065 | 0.048 | 0.036 |
| -0.759999999999997 | 0.062 | 0.047 | 0.035 |
| -0.755999999999997 | 0.06 | 0.045 | 0.034 |
| -0.751999999999997 | 0.058 | 0.044 | 0.033 |
| -0.747999999999997 | 0.056 | 0.042 | 0.032 |
| -0.743999999999997 | 0.054 | 0.041 | 0.031 |
| -0.739999999999997 | 0.052 | 0.04 | 0.03 |
| -0.735999999999997 | 0.05 | 0.038 | 0.029 |
| -0.731999999999997 | 0.048 | 0.037 | 0.028 |
| -0.727999999999997 | 0.046 | 0.036 | 0.027 |
| -0.723999999999997 | 0.045 | 0.034 | 0.026 |
| -0.719999999999997 | 0.043 | 0.033 | 0.026 |
| -0.715999999999997 | 0.041 | 0.032 | 0.025 |
| -0.711999999999997 | 0.04 | 0.031 | 0.024 |
| -0.707999999999997 | 0.038 | 0.03 | 0.023 |
| -0.703999999999997 | 0.037 | 0.029 | 0.022 |
| -0.699999999999997 | 0.035 | 0.028 | 0.022 |
| -0.695999999999997 | 0.034 | 0.027 | 0.021 |
| -0.691999999999997 | 0.033 | 0.026 | 0.02 |
| -0.687999999999997 | 0.031 | 0.025 | 0.019 |
| -0.683999999999997 | 0.03 | 0.024 | 0.019 |
| -0.679999999999997 | 0.029 | 0.023 | 0.018 |
| -0.675999999999997 | 0.028 | 0.022 | 0.017 |
| -0.671999999999997 | 0.026 | 0.021 | 0.017 |
| -0.667999999999997 | 0.025 | 0.02 | 0.016 |
| -0.663999999999997 | 0.024 | 0.02 | 0.016 |
| -0.659999999999997 | 0.023 | 0.019 | 0.015 |
| -0.655999999999997 | 0.022 | 0.018 | 0.015 |
| -0.651999999999997 | 0.021 | 0.017 | 0.014 |
| -0.647999999999997 | 0.02 | 0.017 | 0.013 |
| -0.643999999999997 | 0.02 | 0.016 | 0.013 |
| -0.639999999999997 | 0.019 | 0.015 | 0.012 |
| -0.635999999999997 | 0.018 | 0.015 | 0.012 |
| -0.631999999999997 | 0.017 | 0.014 | 0.011 |
| -0.627999999999997 | 0.016 | 0.013 | 0.011 |
| -0.623999999999997 | 0.016 | 0.013 | 0.011 |
| -0.619999999999997 | 0.015 | 0.012 | 0.01 |
| -0.615999999999997 | 0.014 | 0.012 | 0.01 |
| -0.611999999999997 | 0.014 | 0.011 | 0.009 |
| -0.607999999999997 | 0.013 | 0.011 | 0.009 |
| -0.603999999999997 | 0.012 | 0.01 | 0.009 |
| -0.599999999999997 | 0.012 | 0.01 | 0.008 |
| -0.595999999999997 | 0.011 | 0.009 | 0.008 |
| -0.591999999999997 | 0.011 | 0.009 | 0.007 |
| -0.587999999999997 | 0.01 | 0.009 | 0.007 |
| -0.583999999999997 | 0.01 | 0.008 | 0.007 |
| -0.579999999999997 | 0.009 | 0.008 | 0.007 |
| -0.575999999999997 | 0.009 | 0.007 | 0.006 |
| -0.571999999999997 | 0.008 | 0.007 | 0.006 |
| -0.567999999999997 | 0.008 | 0.007 | 0.006 |
| -0.563999999999997 | 0.007 | 0.006 | 0.005 |
| -0.559999999999997 | 0.007 | 0.006 | 0.005 |
| -0.555999999999997 | 0.007 | 0.006 | 0.005 |
| -0.551999999999997 | 0.006 | 0.005 | 0.005 |
| -0.547999999999997 | 0.006 | 0.005 | 0.004 |
| -0.543999999999997 | 0.006 | 0.005 | 0.004 |
| -0.539999999999997 | 0.005 | 0.005 | 0.004 |
| -0.535999999999997 | 0.005 | 0.004 | 0.004 |
| -0.531999999999997 | 0.005 | 0.004 | 0.004 |
| -0.527999999999997 | 0.005 | 0.004 | 0.003 |
| -0.523999999999997 | 0.004 | 0.004 | 0.003 |
| -0.519999999999997 | 0.004 | 0.004 | 0.003 |
| -0.515999999999997 | 0.004 | 0.003 | 0.003 |
| -0.511999999999997 | 0.004 | 0.003 | 0.003 |
| -0.507999999999997 | 0.003 | 0.003 | 0.003 |
| -0.503999999999997 | 0.003 | 0.003 | 0.003 |
| -0.499999999999997 | 0.003 | 0.003 | 0.002 |
| -0.495999999999997 | 0.003 | 0.003 | 0.002 |
| -0.491999999999997 | 0.003 | 0.002 | 0.002 |
| -0.487999999999997 | 0.003 | 0.002 | 0.002 |
| -0.483999999999997 | 0.002 | 0.002 | 0.002 |
| -0.479999999999997 | 0.002 | 0.002 | 0.002 |
| -0.475999999999997 | 0.002 | 0.002 | 0.002 |
| -0.471999999999997 | 0.002 | 0.002 | 0.002 |
| -0.467999999999997 | 0.002 | 0.002 | 0.001 |
| -0.463999999999997 | 0.002 | 0.002 | 0.001 |
| -0.459999999999997 | 0.002 | 0.001 | 0.001 |
| -0.455999999999997 | 0.002 | 0.001 | 0.001 |
| -0.451999999999997 | 0.001 | 0.001 | 0.001 |
| -0.447999999999997 | 0.001 | 0.001 | 0.001 |
| -0.443999999999997 | 0.001 | 0.001 | 0.001 |
| -0.439999999999997 | 0.001 | 0.001 | 0.001 |
| -0.435999999999997 | 0.001 | 0.001 | 0.001 |
| -0.431999999999997 | 0.001 | 0.001 | 0.001 |
| -0.427999999999997 | 0.001 | 0.001 | 0.001 |
| -0.423999999999997 | 0.001 | 0.001 | 0.001 |
| -0.419999999999997 | 0.001 | 0.001 | 0.001 |
| -0.415999999999997 | 0.001 | 0.001 | 0.001 |
| -0.411999999999997 | 0.001 | 0.001 | 0.001 |
| -0.407999999999997 | 0.001 | 0.001 | 0.001 |
| -0.403999999999997 | 0.001 | 0.001 | 0.001 |
| -0.399999999999997 | 0.001 | 0.001 | 0 |
| -0.395999999999997 | 0.001 | 0 | 0 |
| -0.391999999999997 | 0 | 0 | 0 |
| -0.387999999999997 | 0 | 0 | 0 |
| -0.383999999999997 | 0 | 0 | 0 |
| -0.379999999999997 | 0 | 0 | 0 |
| -0.375999999999997 | 0 | 0 | 0 |
| -0.371999999999997 | 0 | 0 | 0 |
| -0.367999999999997 | 0 | 0 | 0 |
| -0.363999999999997 | 0 | 0 | 0 |
| -0.359999999999997 | 0 | 0 | 0 |
| -0.355999999999997 | 0 | 0 | 0 |
| -0.351999999999997 | 0 | 0 | 0 |
| -0.347999999999997 | 0 | 0 | 0 |
| -0.343999999999997 | 0 | 0 | 0 |
| -0.339999999999997 | 0 | 0 | 0 |
| -0.335999999999997 | 0 | 0 | 0 |
| -0.331999999999997 | 0 | 0 | 0 |
| -0.327999999999997 | 0 | 0 | 0 |
| -0.323999999999997 | 0 | 0 | 0 |
| -0.319999999999997 | 0 | 0 | 0 |
| -0.315999999999997 | 0 | 0 | 0 |
| -0.311999999999997 | 0 | 0 | 0 |
| -0.307999999999997 | 0 | 0 | 0 |
| -0.303999999999997 | 0 | 0 | 0 |
| -0.299999999999997 | 0 | 0 | 0 |
| -0.295999999999997 | 0 | 0 | 0 |
| -0.291999999999997 | 0 | 0 | 0 |
| -0.287999999999997 | 0 | 0 | 0 |
| -0.283999999999997 | 0 | 0 | 0 |
| -0.279999999999997 | 0 | 0 | 0 |
| -0.275999999999997 | 0 | 0 | 0 |
| -0.271999999999997 | 0 | 0 | 0 |
| -0.267999999999997 | 0 | 0 | 0 |
| -0.263999999999997 | 0 | 0 | 0 |
| -0.259999999999997 | 0 | 0 | 0 |
| -0.255999999999997 | 0 | 0 | 0 |
| -0.251999999999997 | 0 | 0 | 0 |
| -0.247999999999997 | 0 | 0 | 0 |
| -0.243999999999997 | 0 | 0 | 0 |
| -0.239999999999997 | 0 | 0 | 0 |
| -0.235999999999997 | 0 | 0 | 0 |
| -0.231999999999997 | 0 | 0 | 0 |
| -0.227999999999997 | 0 | 0 | 0 |
| -0.223999999999997 | 0 | 0 | 0 |
| -0.219999999999997 | 0 | 0 | 0 |
| -0.215999999999997 | 0 | 0 | 0 |
| -0.211999999999997 | 0 | 0 | 0 |
| -0.207999999999997 | 0 | 0 | 0 |
| -0.203999999999997 | 0 | 0 | 0 |
| -0.199999999999997 | 0 | 0 | 0 |
| -0.195999999999997 | 0 | 0 | 0 |
| -0.191999999999997 | 0 | 0 | 0 |
| -0.187999999999997 | 0 | 0 | 0 |
| -0.183999999999997 | 0 | 0 | 0 |
| -0.179999999999997 | 0 | 0 | 0 |
| -0.175999999999997 | 0 | 0 | 0 |
| -0.171999999999997 | 0 | 0 | 0 |
| -0.167999999999997 | 0 | 0 | 0 |
| -0.163999999999997 | 0 | 0 | 0 |
| -0.159999999999997 | 0 | 0 | 0 |
| -0.155999999999997 | 0 | 0 | 0 |
| -0.151999999999997 | 0 | 0 | 0 |
| -0.147999999999997 | 0 | 0 | 0 |
| -0.143999999999997 | 0 | 0 | 0 |
| -0.139999999999997 | 0 | 0 | 0 |
| -0.135999999999997 | 0 | 0 | 0 |
| -0.131999999999997 | 0 | 0 | 0 |
| -0.127999999999997 | 0 | 0 | 0 |
| -0.123999999999997 | 0 | 0 | 0 |
| -0.119999999999997 | 0 | 0 | 0 |
| -0.115999999999997 | 0 | 0 | 0 |
| -0.111999999999997 | 0 | 0 | 0 |
| -0.107999999999997 | 0 | 0 | 0 |
| -0.103999999999997 | 0 | 0 | 0 |
| -0.0999999999999965 | 0 | 0 | 0 |
| -0.0959999999999965 | 0 | 0 | 0 |
| -0.0919999999999965 | 0 | 0 | 0 |
| -0.0879999999999965 | 0 | 0 | 0 |
| -0.0839999999999965 | 0 | 0 | 0 |
| -0.0799999999999965 | 0 | 0 | 0 |
| -0.0759999999999965 | 0 | 0 | 0 |
| -0.0719999999999965 | 0 | 0 | 0 |
| -0.0679999999999965 | 0 | 0 | 0 |
| -0.0639999999999965 | 0 | 0 | 0 |
| -0.0599999999999965 | 0 | 0 | 0 |
| -0.0559999999999965 | 0 | 0 | 0 |
| -0.0519999999999965 | 0 | 0 | 0 |
| -0.0479999999999965 | 0 | 0 | 0 |
| -0.0439999999999965 | 0 | 0 | 0 |
| -0.0399999999999965 | 0 | 0 | 0 |
| -0.0359999999999965 | 0 | 0 | 0 |
| -0.0319999999999965 | 0 | 0 | 0 |
| -0.0279999999999965 | 0 | 0 | 0 |
| -0.0239999999999965 | 0 | 0 | 0 |
| -0.0199999999999965 | 0 | 0 | 0 |
| -0.0159999999999965 | 0 | 0 | 0 |
| -0.0119999999999965 | 0 | 0 | 0 |
| -0.00799999999999647 | 0 | 0 | 0 |
| -0.00399999999999647 | 0 | 0 | 0 |
| 3.52495810318487e-15 | 0 | 0 | 0 |
| 0.00400000000000352 | 0 | 0 | 0 |
| 0.00800000000000352 | 0 | 0 | 0 |
| 0.0120000000000035 | 0 | 0 | 0 |
| 0.0160000000000035 | 0 | 0 | 0 |
| 0.0200000000000035 | 0 | 0 | 0 |
| 0.0240000000000035 | 0 | 0 | 0 |
| 0.0280000000000035 | 0 | 0 | 0 |
| 0.0320000000000035 | 0 | 0 | 0 |
| 0.0360000000000035 | 0 | 0 | 0 |
| 0.0400000000000035 | 0 | 0 | 0 |
| 0.0440000000000035 | 0 | 0 | 0 |
| 0.0480000000000035 | 0 | 0 | 0 |
| 0.0520000000000035 | 0 | 0 | 0 |
| 0.0560000000000035 | 0 | 0 | 0 |
| 0.0600000000000035 | 0 | 0 | 0 |
| 0.0640000000000035 | 0 | 0 | 0 |
| 0.0680000000000035 | 0 | 0 | 0 |
| 0.0720000000000036 | 0 | 0 | 0 |
| 0.0760000000000036 | 0 | 0 | 0 |
| 0.0800000000000036 | 0 | 0 | 0 |
| 0.0840000000000036 | 0 | 0 | 0 |
| 0.0880000000000036 | 0 | 0 | 0 |
| 0.0920000000000036 | 0 | 0 | 0 |
| 0.0960000000000036 | 0 | 0 | 0 |
| 0.100000000000004 | 0 | 0 | 0 |
| 0.104000000000004 | 0 | 0 | 0 |
| 0.108000000000004 | 0 | 0 | 0 |
| 0.112000000000004 | 0 | 0 | 0 |
| 0.116000000000004 | 0 | 0 | 0 |
| 0.120000000000004 | 0 | 0 | 0 |
| 0.124000000000004 | 0 | 0 | 0 |
| 0.128000000000004 | 0 | 0 | 0 |
| 0.132000000000004 | 0 | 0 | 0 |
| 0.136000000000004 | 0 | 0 | 0 |
| 0.140000000000004 | 0 | 0 | 0 |
| 0.144000000000004 | 0 | 0 | 0 |
| 0.148000000000004 | 0 | 0 | 0 |
| 0.152000000000004 | 0 | 0 | 0 |
| 0.156000000000004 | 0 | 0 | 0 |
| 0.160000000000004 | 0 | 0 | 0 |
| 0.164000000000004 | 0 | 0 | 0 |
| 0.168000000000004 | 0 | 0 | 0 |
| 0.172000000000004 | 0 | 0 | 0 |
| 0.176000000000004 | 0 | 0 | 0 |
| 0.180000000000004 | 0 | 0 | 0 |
| 0.184000000000004 | 0 | 0 | 0 |
| 0.188000000000004 | 0 | 0 | 0 |
| 0.192000000000004 | 0 | 0 | 0 |
| 0.196000000000004 | 0 | 0 | 0 |
| 0.200000000000004 | 0 | 0 | 0 |
| 0.204000000000004 | 0 | 0 | 0 |
| 0.208000000000004 | 0 | 0 | 0 |
| 0.212000000000004 | 0 | 0 | 0 |
| 0.216000000000004 | 0 | 0 | 0 |
| 0.220000000000004 | 0 | 0 | 0 |
| 0.224000000000004 | 0 | 0 | 0 |
| 0.228000000000004 | 0 | 0 | 0 |
| 0.232000000000004 | 0 | 0 | 0 |
| 0.236000000000004 | 0 | 0 | 0 |
| 0.240000000000004 | 0 | 0 | 0 |
| 0.244000000000004 | 0 | 0 | 0 |
| 0.248000000000004 | 0 | 0 | 0 |
| 0.252000000000004 | 0 | 0 | 0 |
| 0.256000000000004 | 0 | 0 | 0 |
| 0.260000000000004 | 0 | 0 | 0 |
| 0.264000000000004 | 0 | 0 | 0 |
| 0.268000000000004 | 0 | 0 | 0 |
| 0.272000000000004 | 0 | 0 | 0 |
| 0.276000000000004 | 0 | 0 | 0 |
| 0.280000000000004 | 0 | 0 | 0 |
| 0.284000000000004 | 0 | 0 | 0 |
| 0.288000000000004 | 0 | 0 | 0 |
| 0.292000000000004 | 0 | 0 | 0 |
| 0.296000000000004 | 0 | 0 | 0 |
| 0.300000000000004 | 0 | 0 | 0 |
| 0.304000000000004 | 0 | 0 | 0 |
| 0.308000000000004 | 0 | 0 | 0 |
| 0.312000000000004 | 0 | 0 | 0 |
| 0.316000000000004 | 0 | 0 | 0 |
| 0.320000000000004 | 0 | 0 | 0 |
| 0.324000000000004 | 0 | 0 | 0 |
| 0.328000000000004 | 0 | 0 | 0 |
| 0.332000000000004 | 0 | 0 | 0 |
| 0.336000000000004 | 0 | 0 | 0 |
| 0.340000000000004 | 0 | 0 | 0 |
| 0.344000000000004 | 0 | 0 | 0 |
| 0.348000000000004 | 0 | 0 | 0 |
| 0.352000000000004 | 0 | 0 | 0 |
| 0.356000000000004 | 0 | 0 | 0 |
| 0.360000000000004 | 0 | 0 | 0 |
| 0.364000000000004 | 0 | 0 | 0 |
| 0.368000000000004 | 0 | 0 | 0 |
| 0.372000000000004 | 0 | 0 | 0 |
| 0.376000000000004 | 0 | 0 | 0 |
| 0.380000000000004 | 0 | 0 | 0 |
| 0.384000000000004 | 0 | 0 | 0 |
| 0.388000000000004 | 0 | 0 | 0 |
| 0.392000000000004 | 0 | 0 | 0 |
| 0.396000000000004 | 0.001 | 0 | 0 |
| 0.400000000000004 | 0.001 | 0.001 | 0 |
| 0.404000000000004 | 0.001 | 0.001 | 0.001 |
| 0.408000000000004 | 0.001 | 0.001 | 0.001 |
| 0.412000000000004 | 0.001 | 0.001 | 0.001 |
| 0.416000000000004 | 0.001 | 0.001 | 0.001 |
| 0.420000000000004 | 0.001 | 0.001 | 0.001 |
| 0.424000000000004 | 0.001 | 0.001 | 0.001 |
| 0.428000000000004 | 0.001 | 0.001 | 0.001 |
| 0.432000000000004 | 0.001 | 0.001 | 0.001 |
| 0.436000000000004 | 0.001 | 0.001 | 0.001 |
| 0.440000000000004 | 0.001 | 0.001 | 0.001 |
| 0.444000000000004 | 0.001 | 0.001 | 0.001 |
| 0.448000000000004 | 0.001 | 0.001 | 0.001 |
| 0.452000000000004 | 0.001 | 0.001 | 0.001 |
| 0.456000000000004 | 0.002 | 0.001 | 0.001 |
| 0.460000000000004 | 0.002 | 0.001 | 0.001 |
| 0.464000000000004 | 0.002 | 0.002 | 0.001 |
| 0.468000000000004 | 0.002 | 0.002 | 0.001 |
| 0.472000000000004 | 0.002 | 0.002 | 0.002 |
| 0.476000000000004 | 0.002 | 0.002 | 0.002 |
| 0.480000000000004 | 0.002 | 0.002 | 0.002 |
| 0.484000000000004 | 0.002 | 0.002 | 0.002 |
| 0.488000000000004 | 0.003 | 0.002 | 0.002 |
| 0.492000000000004 | 0.003 | 0.002 | 0.002 |
| 0.496000000000004 | 0.003 | 0.003 | 0.002 |
| 0.500000000000004 | 0.003 | 0.003 | 0.002 |
| 0.504000000000004 | 0.003 | 0.003 | 0.003 |
| 0.508000000000004 | 0.003 | 0.003 | 0.003 |
| 0.512000000000004 | 0.004 | 0.003 | 0.003 |
| 0.516000000000004 | 0.004 | 0.003 | 0.003 |
| 0.520000000000004 | 0.004 | 0.004 | 0.003 |
| 0.524000000000004 | 0.004 | 0.004 | 0.003 |
| 0.528000000000004 | 0.005 | 0.004 | 0.003 |
| 0.532000000000004 | 0.005 | 0.004 | 0.004 |
| 0.536000000000004 | 0.005 | 0.004 | 0.004 |
| 0.540000000000004 | 0.005 | 0.005 | 0.004 |
| 0.544000000000004 | 0.006 | 0.005 | 0.004 |
| 0.548000000000004 | 0.006 | 0.005 | 0.004 |
| 0.552000000000004 | 0.006 | 0.005 | 0.005 |
| 0.556000000000004 | 0.007 | 0.006 | 0.005 |
| 0.560000000000004 | 0.007 | 0.006 | 0.005 |
| 0.564000000000004 | 0.007 | 0.006 | 0.005 |
| 0.568000000000004 | 0.008 | 0.007 | 0.006 |
| 0.572000000000004 | 0.008 | 0.007 | 0.006 |
| 0.576000000000004 | 0.009 | 0.007 | 0.006 |
| 0.580000000000004 | 0.009 | 0.008 | 0.007 |
| 0.584000000000004 | 0.01 | 0.008 | 0.007 |
| 0.588000000000004 | 0.01 | 0.009 | 0.007 |
| 0.592000000000004 | 0.011 | 0.009 | 0.007 |
| 0.596000000000004 | 0.011 | 0.009 | 0.008 |
| 0.600000000000004 | 0.012 | 0.01 | 0.008 |
| 0.604000000000004 | 0.012 | 0.01 | 0.009 |
| 0.608000000000004 | 0.013 | 0.011 | 0.009 |
| 0.612000000000004 | 0.014 | 0.011 | 0.009 |
| 0.616000000000004 | 0.014 | 0.012 | 0.01 |
| 0.620000000000004 | 0.015 | 0.012 | 0.01 |
| 0.624000000000004 | 0.016 | 0.013 | 0.011 |
| 0.628000000000004 | 0.016 | 0.013 | 0.011 |
| 0.632000000000004 | 0.017 | 0.014 | 0.011 |
| 0.636000000000004 | 0.018 | 0.015 | 0.012 |
| 0.640000000000004 | 0.019 | 0.015 | 0.012 |
| 0.644000000000004 | 0.02 | 0.016 | 0.013 |
| 0.648000000000004 | 0.02 | 0.017 | 0.013 |
| 0.652000000000004 | 0.021 | 0.017 | 0.014 |
| 0.656000000000004 | 0.022 | 0.018 | 0.015 |
| 0.660000000000004 | 0.023 | 0.019 | 0.015 |
| 0.664000000000004 | 0.024 | 0.02 | 0.016 |
| 0.668000000000004 | 0.025 | 0.02 | 0.016 |
| 0.672000000000004 | 0.026 | 0.021 | 0.017 |
| 0.676000000000004 | 0.028 | 0.022 | 0.017 |
| 0.680000000000004 | 0.029 | 0.023 | 0.018 |
| 0.684000000000004 | 0.03 | 0.024 | 0.019 |
| 0.688000000000004 | 0.031 | 0.025 | 0.019 |
| 0.692000000000004 | 0.033 | 0.026 | 0.02 |
| 0.696000000000004 | 0.034 | 0.027 | 0.021 |
| 0.700000000000004 | 0.035 | 0.028 | 0.022 |
| 0.704000000000004 | 0.037 | 0.029 | 0.022 |
| 0.708000000000004 | 0.038 | 0.03 | 0.023 |
| 0.712000000000004 | 0.04 | 0.031 | 0.024 |
| 0.716000000000004 | 0.041 | 0.032 | 0.025 |
| 0.720000000000004 | 0.043 | 0.033 | 0.026 |
| 0.724000000000004 | 0.045 | 0.034 | 0.026 |
| 0.728000000000004 | 0.046 | 0.036 | 0.027 |
| 0.732000000000004 | 0.048 | 0.037 | 0.028 |
| 0.736000000000004 | 0.05 | 0.038 | 0.029 |
| 0.740000000000004 | 0.052 | 0.04 | 0.03 |
| 0.744000000000004 | 0.054 | 0.041 | 0.031 |
| 0.748000000000004 | 0.056 | 0.042 | 0.032 |
| 0.752000000000004 | 0.058 | 0.044 | 0.033 |
| 0.756000000000004 | 0.06 | 0.045 | 0.034 |
| 0.760000000000004 | 0.062 | 0.047 | 0.035 |
| 0.764000000000004 | 0.065 | 0.048 | 0.036 |
| 0.768000000000004 | 0.067 | 0.05 | 0.037 |
| 0.772000000000004 | 0.07 | 0.052 | 0.038 |
| 0.776000000000004 | 0.072 | 0.053 | 0.039 |
| 0.780000000000004 | 0.075 | 0.055 | 0.041 |
| 0.784000000000004 | 0.077 | 0.057 | 0.042 |
| 0.788000000000004 | 0.08 | 0.059 | 0.043 |
| 0.792000000000004 | 0.083 | 0.06 | 0.044 |
| 0.796000000000004 | 0.086 | 0.062 | 0.045 |
| 0.800000000000004 | 0.088 | 0.064 | 0.047 |
| 0.804000000000004 | 0.091 | 0.066 | 0.048 |
| 0.808000000000004 | 0.095 | 0.068 | 0.049 |
| 0.812000000000004 | 0.098 | 0.07 | 0.051 |
| 0.816000000000004 | 0.101 | 0.072 | 0.052 |
| 0.820000000000004 | 0.104 | 0.075 | 0.053 |
| 0.824000000000004 | 0.108 | 0.077 | 0.055 |
| 0.828000000000004 | 0.111 | 0.079 | 0.056 |
| 0.832000000000004 | 0.115 | 0.081 | 0.058 |
| 0.836000000000004 | 0.119 | 0.084 | 0.059 |
| 0.840000000000004 | 0.122 | 0.086 | 0.06 |
| 0.844000000000004 | 0.126 | 0.088 | 0.062 |
| 0.848000000000004 | 0.13 | 0.091 | 0.063 |
| 0.852000000000004 | 0.134 | 0.093 | 0.065 |
| 0.856000000000004 | 0.139 | 0.096 | 0.067 |
| 0.860000000000004 | 0.143 | 0.099 | 0.068 |
| 0.864000000000004 | 0.147 | 0.101 | 0.07 |
| 0.868000000000004 | 0.152 | 0.104 | 0.071 |
| 0.872000000000004 | 0.156 | 0.107 | 0.073 |
| 0.876000000000004 | 0.161 | 0.11 | 0.075 |
| 0.880000000000004 | 0.166 | 0.113 | 0.076 |
| 0.884000000000004 | 0.171 | 0.115 | 0.078 |
| 0.888000000000004 | 0.176 | 0.118 | 0.08 |
| 0.892000000000004 | 0.181 | 0.122 | 0.082 |
| 0.896000000000004 | 0.186 | 0.125 | 0.083 |
| 0.900000000000004 | 0.191 | 0.128 | 0.085 |
| 0.904000000000004 | 0.197 | 0.131 | 0.087 |
| 0.908000000000004 | 0.203 | 0.134 | 0.089 |
| 0.912000000000004 | 0.208 | 0.137 | 0.091 |
| 0.916000000000004 | 0.214 | 0.141 | 0.093 |
| 0.920000000000004 | 0.22 | 0.144 | 0.094 |
| 0.924000000000004 | 0.226 | 0.148 | 0.096 |
| 0.928000000000004 | 0.232 | 0.151 | 0.098 |
| 0.932000000000004 | 0.239 | 0.155 | 0.1 |
| 0.936000000000004 | 0.245 | 0.158 | 0.102 |
| 0.940000000000004 | 0.252 | 0.162 | 0.104 |
| 0.944000000000004 | 0.259 | 0.166 | 0.106 |
| 0.948000000000004 | 0.266 | 0.169 | 0.108 |
| 0.952000000000004 | 0.273 | 0.173 | 0.11 |
| 0.956000000000004 | 0.28 | 0.177 | 0.112 |
| 0.960000000000004 | 0.287 | 0.181 | 0.114 |
| 0.964000000000004 | 0.294 | 0.185 | 0.116 |
| 0.968000000000004 | 0.302 | 0.189 | 0.118 |
| 0.972000000000004 | 0.31 | 0.193 | 0.12 |
| 0.976000000000004 | 0.318 | 0.197 | 0.123 |
| 0.980000000000004 | 0.326 | 0.201 | 0.125 |
| 0.984000000000004 | 0.334 | 0.206 | 0.127 |
| 0.988000000000004 | 0.342 | 0.21 | 0.129 |
| 0.992000000000004 | 0.351 | 0.214 | 0.131 |
| 0.996000000000004 | 0.359 | 0.219 | 0.133 |
| 1.000000000000004 | 0.368 | 0.223 | 0.135 |
| 1.004000000000004 | 0.377 | 0.228 | 0.138 |
| 1.008000000000004 | 0.386 | 0.232 | 0.14 |
| 1.012000000000004 | 0.395 | 0.237 | 0.142 |
| 1.016000000000004 | 0.404 | 0.241 | 0.144 |
| 1.020000000000004 | 0.414 | 0.246 | 0.146 |
| 1.024000000000004 | 0.424 | 0.251 | 0.148 |
| 1.028000000000004 | 0.434 | 0.256 | 0.151 |
| 1.032000000000004 | 0.444 | 0.26 | 0.153 |
| 1.036000000000004 | 0.454 | 0.265 | 0.155 |
| 1.040000000000004 | 0.464 | 0.27 | 0.157 |
| 1.044000000000004 | 0.475 | 0.275 | 0.16 |
| 1.048000000000004 | 0.485 | 0.28 | 0.162 |
| 1.052000000000004 | 0.496 | 0.285 | 0.164 |
| 1.056000000000004 | 0.507 | 0.29 | 0.166 |
| 1.060000000000004 | 0.518 | 0.295 | 0.168 |
| 1.064000000000004 | 0.53 | 0.301 | 0.171 |
| 1.068000000000004 | 0.541 | 0.306 | 0.173 |
| 1.072000000000004 | 0.553 | 0.311 | 0.175 |
| 1.076000000000004 | 0.565 | 0.316 | 0.177 |
| 1.080000000000004 | 0.577 | 0.322 | 0.18 |
| 1.084000000000004 | 0.589 | 0.327 | 0.182 |
| 1.088000000000004 | 0.601 | 0.333 | 0.184 |
| 1.092000000000004 | 0.614 | 0.338 | 0.186 |
| 1.096000000000004 | 0.626 | 0.344 | 0.188 |
| 1.100000000000004 | 0.639 | 0.349 | 0.191 |
| 1.104000000000004 | 0.652 | 0.355 | 0.193 |
| 1.108000000000004 | 0.666 | 0.36 | 0.195 |
| 1.112000000000004 | 0.679 | 0.366 | 0.197 |
| 1.116000000000004 | 0.692 | 0.372 | 0.199 |
| 1.120000000000004 | 0.706 | 0.377 | 0.201 |
| 1.124000000000004 | 0.72 | 0.383 | 0.204 |
| 1.128000000000004 | 0.734 | 0.389 | 0.206 |
| 1.132000000000004 | 0.749 | 0.394 | 0.208 |
| 1.136000000000004 | 0.763 | 0.4 | 0.21 |
| 1.140000000000004 | 0.778 | 0.406 | 0.212 |
| 1.144000000000004 | 0.793 | 0.412 | 0.214 |
| 1.148000000000004 | 0.808 | 0.418 | 0.216 |
| 1.152000000000004 | 0.823 | 0.424 | 0.218 |
| 1.156000000000004 | 0.838 | 0.43 | 0.22 |
| 1.160000000000004 | 0.854 | 0.436 | 0.222 |
| 1.164000000000004 | 0.869 | 0.442 | 0.224 |
| 1.168000000000004 | 0.885 | 0.448 | 0.226 |
| 1.172000000000004 | 0.901 | 0.454 | 0.228 |
| 1.176000000000004 | 0.918 | 0.46 | 0.23 |
| 1.180000000000004 | 0.934 | 0.466 | 0.232 |
| 1.184000000000004 | 0.951 | 0.472 | 0.234 |
| 1.188000000000004 | 0.967 | 0.478 | 0.236 |
| 1.192000000000004 | 0.984 | 0.484 | 0.238 |
| 1.196000000000004 | 1.001 | 0.49 | 0.24 |
| 1.200000000000004 | 1.019 | 0.496 | 0.241 |
| 1.204000000000004 | 1.036 | 0.502 | 0.243 |
| 1.208000000000004 | 1.054 | 0.508 | 0.245 |
| 1.212000000000004 | 1.072 | 0.514 | 0.247 |
| 1.216000000000004 | 1.09 | 0.52 | 0.248 |
| 1.220000000000004 | 1.108 | 0.526 | 0.25 |
| 1.224000000000004 | 1.126 | 0.532 | 0.252 |
| 1.228000000000004 | 1.145 | 0.539 | 0.253 |
| 1.232000000000004 | 1.163 | 0.545 | 0.255 |
| 1.236000000000004 | 1.182 | 0.551 | 0.257 |
| 1.240000000000004 | 1.201 | 0.557 | 0.258 |
| 1.244000000000004 | 1.22 | 0.563 | 0.26 |
| 1.248000000000004 | 1.24 | 0.569 | 0.261 |
| 1.252000000000004 | 1.259 | 0.575 | 0.263 |
| 1.256000000000004 | 1.279 | 0.581 | 0.264 |
| 1.260000000000004 | 1.299 | 0.587 | 0.265 |
| 1.264000000000004 | 1.319 | 0.593 | 0.267 |
| 1.268000000000004 | 1.339 | 0.599 | 0.268 |
| 1.272000000000004 | 1.359 | 0.605 | 0.269 |
| 1.276000000000004 | 1.379 | 0.611 | 0.271 |
| 1.280000000000004 | 1.4 | 0.617 | 0.272 |
| 1.284000000000004 | 1.421 | 0.623 | 0.273 |
| 1.288000000000004 | 1.442 | 0.629 | 0.274 |
| 1.292000000000004 | 1.463 | 0.635 | 0.276 |
| 1.296000000000004 | 1.484 | 0.641 | 0.277 |
| 1.300000000000004 | 1.505 | 0.647 | 0.278 |
| 1.304000000000004 | 1.527 | 0.652 | 0.279 |
| 1.308000000000004 | 1.548 | 0.658 | 0.28 |
| 1.312000000000004 | 1.57 | 0.664 | 0.281 |
| 1.316000000000004 | 1.592 | 0.67 | 0.282 |
| 1.320000000000004 | 1.614 | 0.675 | 0.283 |
| 1.324000000000004 | 1.636 | 0.681 | 0.283 |
| 1.328000000000004 | 1.658 | 0.687 | 0.284 |
| 1.332000000000004 | 1.681 | 0.692 | 0.285 |
| 1.336000000000004 | 1.703 | 0.698 | 0.286 |
| 1.340000000000004 | 1.726 | 0.703 | 0.287 |
| 1.344000000000004 | 1.749 | 0.709 | 0.287 |
| 1.348000000000004 | 1.772 | 0.714 | 0.288 |
| 1.352000000000004 | 1.795 | 0.72 | 0.288 |
| 1.356000000000004 | 1.818 | 0.725 | 0.289 |
| 1.360000000000004 | 1.841 | 0.73 | 0.29 |
| 1.364000000000004 | 1.864 | 0.735 | 0.29 |
| 1.368000000000004 | 1.888 | 0.741 | 0.291 |
| 1.372000000000004 | 1.911 | 0.746 | 0.291 |
| 1.376000000000004 | 1.935 | 0.751 | 0.291 |
| 1.380000000000004 | 1.959 | 0.756 | 0.292 |
| 1.384000000000004 | 1.983 | 0.761 | 0.292 |
| 1.388000000000005 | 2.006 | 0.766 | 0.292 |
| 1.392000000000004 | 2.03 | 0.771 | 0.292 |
| 1.396000000000004 | 2.055 | 0.775 | 0.293 |
| 1.400000000000005 | 2.079 | 0.78 | 0.293 |
| 1.404000000000005 | 2.103 | 0.785 | 0.293 |
| 1.408000000000005 | 2.127 | 0.79 | 0.293 |
| 1.412000000000005 | 2.152 | 0.794 | 0.293 |
| 1.416000000000005 | 2.176 | 0.799 | 0.293 |
| 1.420000000000005 | 2.201 | 0.803 | 0.293 |
| 1.424000000000005 | 2.226 | 0.807 | 0.293 |
| 1.428000000000005 | 2.25 | 0.812 | 0.293 |
| 1.432000000000005 | 2.275 | 0.816 | 0.293 |
| 1.436000000000005 | 2.3 | 0.82 | 0.292 |
| 1.440000000000005 | 2.325 | 0.824 | 0.292 |
| 1.444000000000005 | 2.349 | 0.828 | 0.292 |
| 1.448000000000005 | 2.374 | 0.832 | 0.292 |
| 1.452000000000005 | 2.399 | 0.836 | 0.291 |
| 1.456000000000005 | 2.424 | 0.84 | 0.291 |
| 1.460000000000005 | 2.45 | 0.844 | 0.291 |
| 1.464000000000005 | 2.475 | 0.847 | 0.29 |
| 1.468000000000005 | 2.5 | 0.851 | 0.29 |
| 1.472000000000005 | 2.525 | 0.855 | 0.289 |
| 1.476000000000005 | 2.55 | 0.858 | 0.289 |
| 1.480000000000005 | 2.575 | 0.861 | 0.288 |
| 1.484000000000005 | 2.6 | 0.865 | 0.287 |
| 1.488000000000005 | 2.626 | 0.868 | 0.287 |
| 1.492000000000005 | 2.651 | 0.871 | 0.286 |
| 1.496000000000005 | 2.676 | 0.874 | 0.285 |
| 1.500000000000005 | 2.701 | 0.877 | 0.285 |
| 1.504000000000005 | 2.726 | 0.88 | 0.284 |
| 1.508000000000005 | 2.752 | 0.883 | 0.283 |
| 1.512000000000005 | 2.777 | 0.885 | 0.282 |
| 1.516000000000005 | 2.802 | 0.888 | 0.281 |
| 1.520000000000005 | 2.827 | 0.891 | 0.281 |
| 1.524000000000005 | 2.852 | 0.893 | 0.28 |
| 1.528000000000005 | 2.877 | 0.895 | 0.279 |
| 1.532000000000005 | 2.902 | 0.898 | 0.278 |
| 1.536000000000005 | 2.928 | 0.9 | 0.277 |
| 1.540000000000005 | 2.953 | 0.902 | 0.276 |
| 1.544000000000005 | 2.977 | 0.904 | 0.274 |
| 1.548000000000005 | 3.002 | 0.906 | 0.273 |
| 1.552000000000005 | 3.027 | 0.908 | 0.272 |
| 1.556000000000005 | 3.052 | 0.91 | 0.271 |
| 1.560000000000005 | 3.077 | 0.911 | 0.27 |
| 1.564000000000005 | 3.101 | 0.913 | 0.269 |
| 1.568000000000005 | 3.126 | 0.914 | 0.267 |
| 1.572000000000005 | 3.151 | 0.916 | 0.266 |
| 1.576000000000005 | 3.175 | 0.917 | 0.265 |
| 1.580000000000005 | 3.2 | 0.918 | 0.264 |
| 1.584000000000005 | 3.224 | 0.919 | 0.262 |
| 1.588000000000005 | 3.248 | 0.921 | 0.261 |
| 1.592000000000005 | 3.272 | 0.921 | 0.259 |
| 1.596000000000005 | 3.296 | 0.922 | 0.258 |
| 1.600000000000005 | 3.32 | 0.923 | 0.257 |
| 1.604000000000005 | 3.344 | 0.924 | 0.255 |
| 1.608000000000005 | 3.368 | 0.924 | 0.254 |
| 1.612000000000005 | 3.391 | 0.925 | 0.252 |
| 1.616000000000005 | 3.415 | 0.925 | 0.251 |
| 1.620000000000005 | 3.438 | 0.926 | 0.249 |
| 1.624000000000005 | 3.462 | 0.926 | 0.248 |
| 1.628000000000005 | 3.485 | 0.926 | 0.246 |
| 1.632000000000005 | 3.508 | 0.926 | 0.245 |
| 1.636000000000005 | 3.531 | 0.926 | 0.243 |
| 1.640000000000005 | 3.554 | 0.926 | 0.241 |
| 1.644000000000005 | 3.576 | 0.926 | 0.24 |
| 1.648000000000005 | 3.599 | 0.926 | 0.238 |
| 1.652000000000005 | 3.621 | 0.925 | 0.236 |
| 1.656000000000005 | 3.643 | 0.925 | 0.235 |
| 1.660000000000005 | 3.665 | 0.924 | 0.233 |
| 1.664000000000005 | 3.687 | 0.924 | 0.231 |
| 1.668000000000005 | 3.709 | 0.923 | 0.23 |
| 1.672000000000005 | 3.731 | 0.922 | 0.228 |
| 1.676000000000005 | 3.752 | 0.921 | 0.226 |
| 1.680000000000005 | 3.773 | 0.92 | 0.224 |
| 1.684000000000005 | 3.794 | 0.919 | 0.223 |
| 1.688000000000005 | 3.815 | 0.918 | 0.221 |
| 1.692000000000005 | 3.836 | 0.917 | 0.219 |
| 1.696000000000005 | 3.857 | 0.915 | 0.217 |
| 1.700000000000005 | 3.877 | 0.914 | 0.215 |
| 1.704000000000005 | 3.897 | 0.912 | 0.214 |
| 1.708000000000005 | 3.917 | 0.911 | 0.212 |
| 1.712000000000005 | 3.937 | 0.909 | 0.21 |
| 1.716000000000005 | 3.956 | 0.908 | 0.208 |
| 1.720000000000005 | 3.976 | 0.906 | 0.206 |
| 1.724000000000005 | 3.995 | 0.904 | 0.205 |
| 1.728000000000005 | 4.014 | 0.902 | 0.203 |
| 1.732000000000005 | 4.033 | 0.9 | 0.201 |
| 1.736000000000005 | 4.051 | 0.898 | 0.199 |
| 1.740000000000005 | 4.069 | 0.896 | 0.197 |
| 1.744000000000005 | 4.087 | 0.893 | 0.195 |
| 1.748000000000005 | 4.105 | 0.891 | 0.193 |
| 1.752000000000005 | 4.123 | 0.889 | 0.191 |
| 1.756000000000005 | 4.14 | 0.886 | 0.19 |
| 1.760000000000005 | 4.157 | 0.883 | 0.188 |
| 1.764000000000005 | 4.174 | 0.881 | 0.186 |
| 1.768000000000005 | 4.191 | 0.878 | 0.184 |
| 1.772000000000005 | 4.208 | 0.875 | 0.182 |
| 1.776000000000005 | 4.224 | 0.873 | 0.18 |
| 1.780000000000005 | 4.24 | 0.87 | 0.178 |
| 1.784000000000005 | 4.255 | 0.867 | 0.176 |
| 1.788000000000005 | 4.271 | 0.864 | 0.175 |
| 1.792000000000005 | 4.286 | 0.861 | 0.173 |
| 1.796000000000005 | 4.301 | 0.857 | 0.171 |
| 1.800000000000005 | 4.316 | 0.854 | 0.169 |
| 1.804000000000005 | 4.33 | 0.851 | 0.167 |
| 1.808000000000005 | 4.344 | 0.847 | 0.165 |
| 1.812000000000005 | 4.358 | 0.844 | 0.163 |
| 1.816000000000005 | 4.372 | 0.841 | 0.162 |
| 1.820000000000005 | 4.385 | 0.837 | 0.16 |
| 1.824000000000005 | 4.399 | 0.833 | 0.158 |
| 1.828000000000005 | 4.411 | 0.83 | 0.156 |
| 1.832000000000005 | 4.424 | 0.826 | 0.154 |
| 1.836000000000005 | 4.436 | 0.822 | 0.152 |
| 1.840000000000005 | 4.448 | 0.819 | 0.151 |
| 1.844000000000005 | 4.46 | 0.815 | 0.149 |
| 1.848000000000005 | 4.472 | 0.811 | 0.147 |
| 1.852000000000005 | 4.483 | 0.807 | 0.145 |
| 1.856000000000005 | 4.494 | 0.803 | 0.143 |
| 1.860000000000005 | 4.504 | 0.799 | 0.142 |
| 1.864000000000005 | 4.515 | 0.795 | 0.14 |
| 1.868000000000005 | 4.525 | 0.79 | 0.138 |
| 1.872000000000005 | 4.534 | 0.786 | 0.136 |
| 1.876000000000005 | 4.544 | 0.782 | 0.135 |
| 1.880000000000005 | 4.553 | 0.778 | 0.133 |
| 1.884000000000005 | 4.562 | 0.773 | 0.131 |
| 1.888000000000005 | 4.57 | 0.769 | 0.129 |
| 1.892000000000005 | 4.579 | 0.765 | 0.128 |
| 1.896000000000005 | 4.587 | 0.76 | 0.126 |
| 1.900000000000005 | 4.594 | 0.756 | 0.124 |
| 1.904000000000005 | 4.602 | 0.751 | 0.123 |
| 1.908000000000005 | 4.609 | 0.747 | 0.121 |
| 1.912000000000005 | 4.616 | 0.742 | 0.119 |
| 1.916000000000005 | 4.622 | 0.737 | 0.118 |
| 1.920000000000005 | 4.628 | 0.733 | 0.116 |
| 1.924000000000005 | 4.634 | 0.728 | 0.114 |
| 1.928000000000005 | 4.64 | 0.723 | 0.113 |
| 1.932000000000005 | 4.645 | 0.719 | 0.111 |
| 1.936000000000005 | 4.65 | 0.714 | 0.11 |
| 1.940000000000005 | 4.655 | 0.709 | 0.108 |
| 1.944000000000005 | 4.659 | 0.704 | 0.106 |
| 1.948000000000005 | 4.663 | 0.699 | 0.105 |
| 1.952000000000005 | 4.667 | 0.694 | 0.103 |
| 1.956000000000005 | 4.671 | 0.69 | 0.102 |
| 1.960000000000005 | 4.674 | 0.685 | 0.1 |
| 1.964000000000005 | 4.677 | 0.68 | 0.099 |
| 1.968000000000005 | 4.679 | 0.675 | 0.097 |
| 1.972000000000005 | 4.681 | 0.67 | 0.096 |
| 1.976000000000005 | 4.683 | 0.665 | 0.094 |
| 1.980000000000005 | 4.685 | 0.66 | 0.093 |
| 1.984000000000005 | 4.686 | 0.655 | 0.091 |
| 1.988000000000005 | 4.687 | 0.65 | 0.09 |
| 1.992000000000005 | 4.688 | 0.645 | 0.089 |
| 1.996000000000005 | 4.689 | 0.64 | 0.087 |
| 2.000000000000005 | 4.689 | 0.635 | 0.086 |
| 2.004000000000005 | 4.689 | 0.629 | 0.085 |
| 2.008000000000005 | 4.688 | 0.624 | 0.083 |
| 2.012000000000005 | 4.687 | 0.619 | 0.082 |
| 2.016000000000005 | 4.686 | 0.614 | 0.08 |
| 2.020000000000005 | 4.685 | 0.609 | 0.079 |
| 2.024000000000005 | 4.683 | 0.604 | 0.078 |
| 2.028000000000005 | 4.681 | 0.599 | 0.077 |
| 2.032000000000005 | 4.679 | 0.594 | 0.075 |
| 2.036000000000005 | 4.677 | 0.589 | 0.074 |
| 2.040000000000005 | 4.674 | 0.583 | 0.073 |
| 2.044000000000005 | 4.671 | 0.578 | 0.072 |
| 2.048000000000005 | 4.667 | 0.573 | 0.07 |
| 2.052000000000005 | 4.664 | 0.568 | 0.069 |
| 2.056000000000005 | 4.66 | 0.563 | 0.068 |
| 2.060000000000005 | 4.655 | 0.558 | 0.067 |
| 2.064000000000005 | 4.651 | 0.553 | 0.066 |
| 2.068000000000005 | 4.646 | 0.548 | 0.065 |
| 2.072000000000005 | 4.641 | 0.542 | 0.063 |
| 2.076000000000005 | 4.636 | 0.537 | 0.062 |
| 2.080000000000005 | 4.63 | 0.532 | 0.061 |
| 2.084000000000005 | 4.624 | 0.527 | 0.06 |
| 2.088000000000005 | 4.618 | 0.522 | 0.059 |
| 2.092000000000005 | 4.611 | 0.517 | 0.058 |
| 2.096000000000005 | 4.604 | 0.512 | 0.057 |
| 2.100000000000005 | 4.597 | 0.507 | 0.056 |
| 2.104000000000005 | 4.59 | 0.502 | 0.055 |
| 2.108000000000005 | 4.583 | 0.497 | 0.054 |
| 2.112000000000005 | 4.575 | 0.492 | 0.053 |
| 2.116000000000005 | 4.567 | 0.487 | 0.052 |
| 2.120000000000005 | 4.558 | 0.482 | 0.051 |
| 2.124000000000005 | 4.55 | 0.477 | 0.05 |
| 2.128000000000005 | 4.541 | 0.472 | 0.049 |
| 2.132000000000005 | 4.532 | 0.467 | 0.048 |
| 2.136000000000005 | 4.522 | 0.462 | 0.047 |
| 2.140000000000005 | 4.512 | 0.457 | 0.046 |
| 2.144000000000005 | 4.503 | 0.452 | 0.045 |
| 2.148000000000005 | 4.492 | 0.447 | 0.045 |
| 2.152000000000005 | 4.482 | 0.442 | 0.044 |
| 2.156000000000005 | 4.471 | 0.438 | 0.043 |
| 2.160000000000005 | 4.461 | 0.433 | 0.042 |
| 2.164000000000005 | 4.449 | 0.428 | 0.041 |
| 2.168000000000005 | 4.438 | 0.423 | 0.04 |
| 2.172000000000005 | 4.426 | 0.418 | 0.04 |
| 2.176000000000005 | 4.415 | 0.414 | 0.039 |
| 2.180000000000005 | 4.403 | 0.409 | 0.038 |
| 2.184000000000005 | 4.39 | 0.404 | 0.037 |
| 2.188000000000005 | 4.378 | 0.4 | 0.036 |
| 2.192000000000005 | 4.365 | 0.395 | 0.036 |
| 2.196000000000005 | 4.352 | 0.39 | 0.035 |
| 2.200000000000005 | 4.339 | 0.386 | 0.034 |
| 2.204000000000005 | 4.326 | 0.381 | 0.034 |
| 2.208000000000005 | 4.312 | 0.377 | 0.033 |
| 2.212000000000005 | 4.298 | 0.372 | 0.032 |
| 2.216000000000005 | 4.284 | 0.368 | 0.032 |
| 2.220000000000005 | 4.27 | 0.363 | 0.031 |
| 2.224000000000005 | 4.256 | 0.359 | 0.03 |
| 2.228000000000005 | 4.241 | 0.354 | 0.03 |
| 2.232000000000005 | 4.226 | 0.35 | 0.029 |
| 2.236000000000005 | 4.211 | 0.346 | 0.028 |
| 2.240000000000005 | 4.196 | 0.341 | 0.028 |
| 2.244000000000005 | 4.181 | 0.337 | 0.027 |
| 2.248000000000005 | 4.165 | 0.333 | 0.027 |
| 2.252000000000005 | 4.15 | 0.329 | 0.026 |
| 2.256000000000005 | 4.134 | 0.324 | 0.025 |
| 2.260000000000005 | 4.118 | 0.32 | 0.025 |
| 2.264000000000005 | 4.102 | 0.316 | 0.024 |
| 2.268000000000005 | 4.085 | 0.312 | 0.024 |
| 2.272000000000005 | 4.069 | 0.308 | 0.023 |
| 2.276000000000005 | 4.052 | 0.304 | 0.023 |
| 2.280000000000005 | 4.035 | 0.3 | 0.022 |
| 2.284000000000005 | 4.018 | 0.296 | 0.022 |
| 2.288000000000005 | 4.001 | 0.292 | 0.021 |
| 2.292000000000005 | 3.983 | 0.288 | 0.021 |
| 2.296000000000005 | 3.966 | 0.284 | 0.02 |
| 2.300000000000005 | 3.948 | 0.28 | 0.02 |
| 2.304000000000005 | 3.93 | 0.277 | 0.019 |
| 2.308000000000005 | 3.913 | 0.273 | 0.019 |
| 2.312000000000005 | 3.894 | 0.269 | 0.019 |
| 2.316000000000005 | 3.876 | 0.265 | 0.018 |
| 2.320000000000005 | 3.858 | 0.262 | 0.018 |
| 2.324000000000005 | 3.84 | 0.258 | 0.017 |
| 2.328000000000005 | 3.821 | 0.254 | 0.017 |
| 2.332000000000005 | 3.802 | 0.251 | 0.017 |
| 2.336000000000005 | 3.783 | 0.247 | 0.016 |
| 2.340000000000005 | 3.764 | 0.244 | 0.016 |
| 2.344000000000005 | 3.745 | 0.24 | 0.015 |
| 2.348000000000005 | 3.726 | 0.237 | 0.015 |
| 2.352000000000005 | 3.707 | 0.233 | 0.015 |
| 2.356000000000005 | 3.688 | 0.23 | 0.014 |
| 2.360000000000005 | 3.668 | 0.226 | 0.014 |
| 2.364000000000005 | 3.649 | 0.223 | 0.014 |
| 2.368000000000005 | 3.629 | 0.22 | 0.013 |
| 2.372000000000005 | 3.609 | 0.217 | 0.013 |
| 2.376000000000005 | 3.589 | 0.213 | 0.013 |
| 2.380000000000005 | 3.569 | 0.21 | 0.012 |
| 2.384000000000005 | 3.549 | 0.207 | 0.012 |
| 2.388000000000005 | 3.529 | 0.204 | 0.012 |
| 2.392000000000005 | 3.509 | 0.201 | 0.011 |
| 2.396000000000005 | 3.489 | 0.198 | 0.011 |
| 2.400000000000005 | 3.469 | 0.195 | 0.011 |
| 2.404000000000005 | 3.448 | 0.192 | 0.011 |
| 2.408000000000005 | 3.428 | 0.189 | 0.01 |
| 2.412000000000005 | 3.407 | 0.186 | 0.01 |
| 2.416000000000005 | 3.387 | 0.183 | 0.01 |
| 2.420000000000005 | 3.366 | 0.18 | 0.01 |
| 2.424000000000005 | 3.345 | 0.177 | 0.009 |
| 2.428000000000005 | 3.325 | 0.174 | 0.009 |
| 2.432000000000005 | 3.304 | 0.172 | 0.009 |
| 2.436000000000005 | 3.283 | 0.169 | 0.009 |
| 2.440000000000005 | 3.262 | 0.166 | 0.008 |
| 2.444000000000005 | 3.241 | 0.164 | 0.008 |
| 2.448000000000005 | 3.22 | 0.161 | 0.008 |
| 2.452000000000005 | 3.199 | 0.158 | 0.008 |
| 2.456000000000005 | 3.178 | 0.156 | 0.008 |
| 2.460000000000005 | 3.157 | 0.153 | 0.007 |
| 2.464000000000005 | 3.136 | 0.151 | 0.007 |
| 2.468000000000005 | 3.115 | 0.148 | 0.007 |
| 2.472000000000005 | 3.094 | 0.146 | 0.007 |
| 2.476000000000005 | 3.073 | 0.143 | 0.007 |
| 2.480000000000005 | 3.052 | 0.141 | 0.007 |
| 2.484000000000005 | 3.03 | 0.139 | 0.006 |
| 2.488000000000005 | 3.009 | 0.136 | 0.006 |
| 2.492000000000005 | 2.988 | 0.134 | 0.006 |
| 2.496000000000005 | 2.967 | 0.132 | 0.006 |
| 2.500000000000005 | 2.946 | 0.129 | 0.006 |
| 2.504000000000005 | 2.924 | 0.127 | 0.006 |
| 2.508000000000005 | 2.903 | 0.125 | 0.005 |
| 2.512000000000005 | 2.882 | 0.123 | 0.005 |
| 2.516000000000005 | 2.861 | 0.121 | 0.005 |
| 2.520000000000005 | 2.84 | 0.119 | 0.005 |
| 2.524000000000005 | 2.818 | 0.117 | 0.005 |
| 2.528000000000005 | 2.797 | 0.115 | 0.005 |
| 2.532000000000005 | 2.776 | 0.113 | 0.005 |
| 2.536000000000005 | 2.755 | 0.111 | 0.004 |
| 2.540000000000005 | 2.734 | 0.109 | 0.004 |
| 2.544000000000005 | 2.713 | 0.107 | 0.004 |
| 2.548000000000005 | 2.692 | 0.105 | 0.004 |
| 2.552000000000005 | 2.671 | 0.103 | 0.004 |
| 2.556000000000005 | 2.65 | 0.101 | 0.004 |
| 2.560000000000005 | 2.629 | 0.099 | 0.004 |
| 2.564000000000005 | 2.608 | 0.097 | 0.004 |
| 2.568000000000005 | 2.587 | 0.096 | 0.004 |
| 2.572000000000005 | 2.566 | 0.094 | 0.003 |
| 2.576000000000005 | 2.545 | 0.092 | 0.003 |
| 2.580000000000005 | 2.524 | 0.091 | 0.003 |
| 2.584000000000005 | 2.503 | 0.089 | 0.003 |
| 2.588000000000005 | 2.483 | 0.087 | 0.003 |
| 2.592000000000005 | 2.462 | 0.086 | 0.003 |
| 2.596000000000005 | 2.441 | 0.084 | 0.003 |
| 2.600000000000005 | 2.421 | 0.082 | 0.003 |
| 2.604000000000005 | 2.4 | 0.081 | 0.003 |
| 2.608000000000005 | 2.38 | 0.079 | 0.003 |
| 2.612000000000005 | 2.359 | 0.078 | 0.003 |
| 2.616000000000005 | 2.339 | 0.076 | 0.002 |
| 2.620000000000005 | 2.319 | 0.075 | 0.002 |
| 2.624000000000005 | 2.298 | 0.074 | 0.002 |
| 2.628000000000005 | 2.278 | 0.072 | 0.002 |
| 2.632000000000005 | 2.258 | 0.071 | 0.002 |
| 2.636000000000005 | 2.238 | 0.069 | 0.002 |
| 2.640000000000005 | 2.218 | 0.068 | 0.002 |
| 2.644000000000005 | 2.198 | 0.067 | 0.002 |
| 2.648000000000005 | 2.178 | 0.065 | 0.002 |
| 2.652000000000005 | 2.158 | 0.064 | 0.002 |
| 2.656000000000005 | 2.139 | 0.063 | 0.002 |
| 2.660000000000005 | 2.119 | 0.062 | 0.002 |
| 2.664000000000005 | 2.1 | 0.06 | 0.002 |
| 2.668000000000005 | 2.08 | 0.059 | 0.002 |
| 2.672000000000005 | 2.061 | 0.058 | 0.002 |
| 2.676000000000005 | 2.041 | 0.057 | 0.002 |
| 2.680000000000005 | 2.022 | 0.056 | 0.002 |
| 2.684000000000005 | 2.003 | 0.055 | 0.001 |
| 2.688000000000005 | 1.984 | 0.054 | 0.001 |
| 2.692000000000005 | 1.965 | 0.052 | 0.001 |
| 2.696000000000005 | 1.946 | 0.051 | 0.001 |
| 2.700000000000005 | 1.927 | 0.05 | 0.001 |
| 2.704000000000005 | 1.908 | 0.049 | 0.001 |
| 2.708000000000005 | 1.89 | 0.048 | 0.001 |
| 2.712000000000005 | 1.871 | 0.047 | 0.001 |
| 2.716000000000005 | 1.853 | 0.046 | 0.001 |
| 2.720000000000005 | 1.834 | 0.045 | 0.001 |
| 2.724000000000005 | 1.816 | 0.044 | 0.001 |
| 2.728000000000005 | 1.798 | 0.044 | 0.001 |
| 2.732000000000005 | 1.78 | 0.043 | 0.001 |
| 2.736000000000005 | 1.762 | 0.042 | 0.001 |
| 2.740000000000005 | 1.744 | 0.041 | 0.001 |
| 2.744000000000005 | 1.726 | 0.04 | 0.001 |
| 2.748000000000005 | 1.708 | 0.039 | 0.001 |
| 2.752000000000005 | 1.691 | 0.038 | 0.001 |
| 2.756000000000005 | 1.673 | 0.038 | 0.001 |
| 2.760000000000005 | 1.656 | 0.037 | 0.001 |
| 2.764000000000005 | 1.638 | 0.036 | 0.001 |
| 2.768000000000005 | 1.621 | 0.035 | 0.001 |
| 2.772000000000005 | 1.604 | 0.034 | 0.001 |
| 2.776000000000005 | 1.587 | 0.034 | 0.001 |
| 2.780000000000005 | 1.57 | 0.033 | 0.001 |
| 2.784000000000005 | 1.553 | 0.032 | 0.001 |
| 2.788000000000006 | 1.537 | 0.032 | 0.001 |
| 2.792000000000005 | 1.52 | 0.031 | 0.001 |
| 2.796000000000005 | 1.504 | 0.03 | 0.001 |
| 2.800000000000006 | 1.487 | 0.03 | 0.001 |
| 2.804000000000006 | 1.471 | 0.029 | 0.001 |
| 2.808000000000006 | 1.455 | 0.028 | 0.001 |
| 2.812000000000006 | 1.439 | 0.028 | 0.001 |
| 2.816000000000006 | 1.423 | 0.027 | 0.001 |
| 2.820000000000006 | 1.407 | 0.026 | 0 |
| 2.824000000000006 | 1.391 | 0.026 | 0 |
| 2.828000000000006 | 1.376 | 0.025 | 0 |
| 2.832000000000006 | 1.36 | 0.025 | 0 |
| 2.836000000000006 | 1.345 | 0.024 | 0 |
| 2.840000000000006 | 1.33 | 0.024 | 0 |
| 2.844000000000006 | 1.314 | 0.023 | 0 |
| 2.848000000000006 | 1.299 | 0.023 | 0 |
| 2.852000000000006 | 1.284 | 0.022 | 0 |
| 2.856000000000006 | 1.27 | 0.021 | 0 |
| 2.860000000000006 | 1.255 | 0.021 | 0 |
| 2.864000000000006 | 1.24 | 0.021 | 0 |
| 2.868000000000006 | 1.226 | 0.02 | 0 |
| 2.872000000000006 | 1.211 | 0.02 | 0 |
| 2.876000000000006 | 1.197 | 0.019 | 0 |
| 2.880000000000006 | 1.183 | 0.019 | 0 |
| 2.884000000000006 | 1.169 | 0.018 | 0 |
| 2.888000000000006 | 1.155 | 0.018 | 0 |
| 2.892000000000006 | 1.141 | 0.017 | 0 |
| 2.896000000000006 | 1.127 | 0.017 | 0 |
| 2.900000000000006 | 1.114 | 0.017 | 0 |
| 2.904000000000006 | 1.1 | 0.016 | 0 |
| 2.908000000000006 | 1.087 | 0.016 | 0 |
| 2.912000000000006 | 1.074 | 0.015 | 0 |
| 2.916000000000006 | 1.06 | 0.015 | 0 |
| 2.920000000000006 | 1.047 | 0.015 | 0 |
| 2.924000000000006 | 1.034 | 0.014 | 0 |
| 2.928000000000006 | 1.022 | 0.014 | 0 |
| 2.932000000000006 | 1.009 | 0.014 | 0 |
| 2.936000000000006 | 0.996 | 0.013 | 0 |
| 2.940000000000006 | 0.984 | 0.013 | 0 |
| 2.944000000000006 | 0.971 | 0.013 | 0 |
| 2.948000000000006 | 0.959 | 0.012 | 0 |
| 2.952000000000006 | 0.947 | 0.012 | 0 |
| 2.956000000000006 | 0.935 | 0.012 | 0 |
| 2.960000000000006 | 0.923 | 0.012 | 0 |
| 2.964000000000006 | 0.911 | 0.011 | 0 |
| 2.968000000000006 | 0.899 | 0.011 | 0 |
| 2.972000000000006 | 0.888 | 0.011 | 0 |
| 2.976000000000006 | 0.876 | 0.01 | 0 |
| 2.980000000000006 | 0.865 | 0.01 | 0 |
| 2.984000000000006 | 0.854 | 0.01 | 0 |
| 2.988000000000006 | 0.843 | 0.01 | 0 |
| 2.992000000000006 | 0.831 | 0.009 | 0 |
| 2.996000000000006 | 0.821 | 0.009 | 0 |
| 3.000000000000006 | 0.81 | 0.009 | 0 |
| 3.004000000000006 | 0.799 | 0.009 | 0 |
| 3.008000000000006 | 0.788 | 0.009 | 0 |
| 3.012000000000006 | 0.778 | 0.008 | 0 |
| 3.016000000000006 | 0.767 | 0.008 | 0 |
| 3.020000000000006 | 0.757 | 0.008 | 0 |
| 3.024000000000006 | 0.747 | 0.008 | 0 |
| 3.028000000000006 | 0.737 | 0.008 | 0 |
| 3.032000000000006 | 0.727 | 0.007 | 0 |
| 3.036000000000006 | 0.717 | 0.007 | 0 |
| 3.040000000000006 | 0.707 | 0.007 | 0 |
| 3.044000000000006 | 0.697 | 0.007 | 0 |
| 3.048000000000006 | 0.688 | 0.007 | 0 |
| 3.052000000000006 | 0.678 | 0.006 | 0 |
| 3.056000000000006 | 0.669 | 0.006 | 0 |
| 3.060000000000006 | 0.659 | 0.006 | 0 |
| 3.064000000000006 | 0.65 | 0.006 | 0 |
| 3.068000000000006 | 0.641 | 0.006 | 0 |
| 3.072000000000006 | 0.632 | 0.006 | 0 |
| 3.076000000000006 | 0.623 | 0.005 | 0 |
| 3.080000000000006 | 0.614 | 0.005 | 0 |
| 3.084000000000006 | 0.606 | 0.005 | 0 |
| 3.088000000000006 | 0.597 | 0.005 | 0 |
| 3.092000000000006 | 0.589 | 0.005 | 0 |
| 3.096000000000006 | 0.58 | 0.005 | 0 |
| 3.100000000000006 | 0.572 | 0.005 | 0 |
| 3.104000000000006 | 0.564 | 0.005 | 0 |
| 3.108000000000006 | 0.556 | 0.004 | 0 |
| 3.112000000000006 | 0.547 | 0.004 | 0 |
| 3.116000000000006 | 0.54 | 0.004 | 0 |
| 3.120000000000006 | 0.532 | 0.004 | 0 |
| 3.124000000000006 | 0.524 | 0.004 | 0 |
| 3.128000000000006 | 0.516 | 0.004 | 0 |
| 3.132000000000006 | 0.509 | 0.004 | 0 |
| 3.136000000000006 | 0.501 | 0.004 | 0 |
| 3.140000000000006 | 0.494 | 0.004 | 0 |
| 3.144000000000006 | 0.486 | 0.003 | 0 |
| 3.148000000000006 | 0.479 | 0.003 | 0 |
| 3.152000000000006 | 0.472 | 0.003 | 0 |
| 3.156000000000006 | 0.465 | 0.003 | 0 |
| 3.160000000000006 | 0.458 | 0.003 | 0 |
| 3.164000000000006 | 0.451 | 0.003 | 0 |
| 3.168000000000006 | 0.444 | 0.003 | 0 |
| 3.172000000000006 | 0.437 | 0.003 | 0 |
| 3.176000000000006 | 0.431 | 0.003 | 0 |
| 3.180000000000006 | 0.424 | 0.003 | 0 |
| 3.184000000000006 | 0.418 | 0.003 | 0 |
| 3.188000000000006 | 0.411 | 0.003 | 0 |
| 3.192000000000006 | 0.405 | 0.002 | 0 |
| 3.196000000000006 | 0.399 | 0.002 | 0 |
| 3.200000000000006 | 0.393 | 0.002 | 0 |
| 3.204000000000006 | 0.387 | 0.002 | 0 |
| 3.208000000000006 | 0.381 | 0.002 | 0 |
| 3.212000000000006 | 0.375 | 0.002 | 0 |
| 3.216000000000006 | 0.369 | 0.002 | 0 |
| 3.220000000000006 | 0.363 | 0.002 | 0 |
| 3.224000000000006 | 0.357 | 0.002 | 0 |
| 3.228000000000006 | 0.352 | 0.002 | 0 |
| 3.232000000000006 | 0.346 | 0.002 | 0 |
| 3.236000000000006 | 0.341 | 0.002 | 0 |
| 3.240000000000006 | 0.335 | 0.002 | 0 |
| 3.244000000000006 | 0.33 | 0.002 | 0 |
| 3.248000000000006 | 0.325 | 0.002 | 0 |
| 3.252000000000006 | 0.319 | 0.002 | 0 |
| 3.256000000000006 | 0.314 | 0.002 | 0 |
| 3.260000000000006 | 0.309 | 0.002 | 0 |
| 3.264000000000006 | 0.304 | 0.001 | 0 |
| 3.268000000000006 | 0.299 | 0.001 | 0 |
| 3.272000000000006 | 0.294 | 0.001 | 0 |
| 3.276000000000006 | 0.29 | 0.001 | 0 |
| 3.280000000000006 | 0.285 | 0.001 | 0 |
| 3.284000000000006 | 0.28 | 0.001 | 0 |
| 3.288000000000006 | 0.276 | 0.001 | 0 |
| 3.292000000000006 | 0.271 | 0.001 | 0 |
| 3.296000000000006 | 0.267 | 0.001 | 0 |
| 3.300000000000006 | 0.262 | 0.001 | 0 |
| 3.304000000000006 | 0.258 | 0.001 | 0 |
| 3.308000000000006 | 0.254 | 0.001 | 0 |
| 3.312000000000006 | 0.249 | 0.001 | 0 |
| 3.316000000000006 | 0.245 | 0.001 | 0 |
| 3.320000000000006 | 0.241 | 0.001 | 0 |
| 3.324000000000006 | 0.237 | 0.001 | 0 |
| 3.328000000000006 | 0.233 | 0.001 | 0 |
| 3.332000000000006 | 0.229 | 0.001 | 0 |
| 3.336000000000006 | 0.225 | 0.001 | 0 |
| 3.340000000000006 | 0.221 | 0.001 | 0 |
| 3.344000000000006 | 0.218 | 0.001 | 0 |
| 3.348000000000006 | 0.214 | 0.001 | 0 |
| 3.352000000000006 | 0.21 | 0.001 | 0 |
| 3.356000000000006 | 0.207 | 0.001 | 0 |
| 3.360000000000006 | 0.203 | 0.001 | 0 |
| 3.364000000000006 | 0.2 | 0.001 | 0 |
| 3.368000000000006 | 0.196 | 0.001 | 0 |
| 3.372000000000006 | 0.193 | 0.001 | 0 |
| 3.376000000000006 | 0.189 | 0.001 | 0 |
| 3.380000000000006 | 0.186 | 0.001 | 0 |
| 3.384000000000006 | 0.183 | 0.001 | 0 |
| 3.388000000000006 | 0.18 | 0.001 | 0 |
| 3.392000000000006 | 0.177 | 0.001 | 0 |
| 3.396000000000006 | 0.173 | 0.001 | 0 |
| 3.400000000000006 | 0.17 | 0.001 | 0 |
| 3.404000000000006 | 0.167 | 0.001 | 0 |
| 3.408000000000006 | 0.164 | 0 | 0 |
| 3.412000000000006 | 0.161 | 0 | 0 |
| 3.416000000000006 | 0.159 | 0 | 0 |
| 3.420000000000006 | 0.156 | 0 | 0 |
| 3.424000000000006 | 0.153 | 0 | 0 |
| 3.428000000000006 | 0.15 | 0 | 0 |
| 3.432000000000006 | 0.148 | 0 | 0 |
| 3.436000000000006 | 0.145 | 0 | 0 |
| 3.440000000000006 | 0.142 | 0 | 0 |
| 3.444000000000006 | 0.14 | 0 | 0 |
| 3.448000000000006 | 0.137 | 0 | 0 |
| 3.452000000000006 | 0.135 | 0 | 0 |
| 3.456000000000006 | 0.132 | 0 | 0 |
| 3.460000000000006 | 0.13 | 0 | 0 |
| 3.464000000000006 | 0.127 | 0 | 0 |
| 3.468000000000006 | 0.125 | 0 | 0 |
| 3.472000000000006 | 0.123 | 0 | 0 |
| 3.476000000000006 | 0.121 | 0 | 0 |
| 3.480000000000006 | 0.118 | 0 | 0 |
| 3.484000000000006 | 0.116 | 0 | 0 |
| 3.488000000000006 | 0.114 | 0 | 0 |
| 3.492000000000006 | 0.112 | 0 | 0 |
| 3.496000000000006 | 0.11 | 0 | 0 |
| 3.500000000000006 | 0.108 | 0 | 0 |
| 3.504000000000006 | 0.106 | 0 | 0 |
| 3.508000000000006 | 0.104 | 0 | 0 |
| 3.512000000000006 | 0.102 | 0 | 0 |
| 3.516000000000006 | 0.1 | 0 | 0 |
| 3.520000000000006 | 0.098 | 0 | 0 |
| 3.524000000000006 | 0.096 | 0 | 0 |
| 3.528000000000006 | 0.094 | 0 | 0 |
| 3.532000000000006 | 0.093 | 0 | 0 |
| 3.536000000000006 | 0.091 | 0 | 0 |
| 3.540000000000006 | 0.089 | 0 | 0 |
| 3.544000000000006 | 0.087 | 0 | 0 |
| 3.548000000000006 | 0.086 | 0 | 0 |
| 3.552000000000006 | 0.084 | 0 | 0 |
| 3.556000000000006 | 0.082 | 0 | 0 |
| 3.560000000000006 | 0.081 | 0 | 0 |
| 3.564000000000006 | 0.079 | 0 | 0 |
| 3.568000000000006 | 0.078 | 0 | 0 |
| 3.572000000000006 | 0.076 | 0 | 0 |
| 3.576000000000006 | 0.075 | 0 | 0 |
| 3.580000000000006 | 0.073 | 0 | 0 |
| 3.584000000000006 | 0.072 | 0 | 0 |
| 3.588000000000006 | 0.07 | 0 | 0 |
| 3.592000000000006 | 0.069 | 0 | 0 |
| 3.596000000000006 | 0.068 | 0 | 0 |
| 3.600000000000006 | 0.066 | 0 | 0 |
| 3.604000000000006 | 0.065 | 0 | 0 |
| 3.608000000000006 | 0.064 | 0 | 0 |
| 3.612000000000006 | 0.063 | 0 | 0 |
| 3.616000000000006 | 0.061 | 0 | 0 |
| 3.620000000000006 | 0.06 | 0 | 0 |
| 3.624000000000006 | 0.059 | 0 | 0 |
| 3.628000000000006 | 0.058 | 0 | 0 |
| 3.632000000000006 | 0.057 | 0 | 0 |
| 3.636000000000006 | 0.055 | 0 | 0 |
| 3.640000000000006 | 0.054 | 0 | 0 |
| 3.644000000000006 | 0.053 | 0 | 0 |
| 3.648000000000006 | 0.052 | 0 | 0 |
| 3.652000000000006 | 0.051 | 0 | 0 |
| 3.656000000000006 | 0.05 | 0 | 0 |
| 3.660000000000006 | 0.049 | 0 | 0 |
| 3.664000000000006 | 0.048 | 0 | 0 |
| 3.668000000000006 | 0.047 | 0 | 0 |
| 3.672000000000006 | 0.046 | 0 | 0 |
| 3.676000000000006 | 0.045 | 0 | 0 |
| 3.680000000000006 | 0.044 | 0 | 0 |
| 3.684000000000006 | 0.043 | 0 | 0 |
| 3.688000000000006 | 0.042 | 0 | 0 |
| 3.692000000000006 | 0.042 | 0 | 0 |
| 3.696000000000006 | 0.041 | 0 | 0 |
| 3.700000000000006 | 0.04 | 0 | 0 |
| 3.704000000000006 | 0.039 | 0 | 0 |
| 3.708000000000006 | 0.038 | 0 | 0 |
| 3.712000000000006 | 0.037 | 0 | 0 |
| 3.716000000000006 | 0.037 | 0 | 0 |
| 3.720000000000006 | 0.036 | 0 | 0 |
| 3.724000000000006 | 0.035 | 0 | 0 |
| 3.728000000000006 | 0.034 | 0 | 0 |
| 3.732000000000006 | 0.034 | 0 | 0 |
| 3.736000000000006 | 0.033 | 0 | 0 |
| 3.740000000000006 | 0.032 | 0 | 0 |
| 3.744000000000006 | 0.032 | 0 | 0 |
| 3.748000000000006 | 0.031 | 0 | 0 |
| 3.752000000000006 | 0.03 | 0 | 0 |
| 3.756000000000006 | 0.03 | 0 | 0 |
| 3.760000000000006 | 0.029 | 0 | 0 |
| 3.764000000000006 | 0.028 | 0 | 0 |
| 3.768000000000006 | 0.028 | 0 | 0 |
| 3.772000000000006 | 0.027 | 0 | 0 |
| 3.776000000000006 | 0.027 | 0 | 0 |
| 3.780000000000006 | 0.026 | 0 | 0 |
| 3.784000000000006 | 0.025 | 0 | 0 |
| 3.788000000000006 | 0.025 | 0 | 0 |
| 3.792000000000006 | 0.024 | 0 | 0 |
| 3.796000000000006 | 0.024 | 0 | 0 |
| 3.800000000000006 | 0.023 | 0 | 0 |
| 3.804000000000006 | 0.023 | 0 | 0 |
| 3.808000000000006 | 0.022 | 0 | 0 |
| 3.812000000000006 | 0.022 | 0 | 0 |
| 3.816000000000006 | 0.021 | 0 | 0 |
| 3.820000000000006 | 0.021 | 0 | 0 |
| 3.824000000000006 | 0.02 | 0 | 0 |
| 3.828000000000006 | 0.02 | 0 | 0 |
| 3.832000000000006 | 0.02 | 0 | 0 |
| 3.836000000000006 | 0.019 | 0 | 0 |
| 3.840000000000006 | 0.019 | 0 | 0 |
| 3.844000000000006 | 0.018 | 0 | 0 |
| 3.848000000000006 | 0.018 | 0 | 0 |
| 3.852000000000006 | 0.017 | 0 | 0 |
| 3.856000000000006 | 0.017 | 0 | 0 |
| 3.860000000000006 | 0.017 | 0 | 0 |
| 3.864000000000006 | 0.016 | 0 | 0 |
| 3.868000000000006 | 0.016 | 0 | 0 |
| 3.872000000000006 | 0.016 | 0 | 0 |
| 3.876000000000006 | 0.015 | 0 | 0 |
| 3.880000000000006 | 0.015 | 0 | 0 |
| 3.884000000000006 | 0.015 | 0 | 0 |
| 3.888000000000007 | 0.014 | 0 | 0 |
| 3.892000000000006 | 0.014 | 0 | 0 |
| 3.896000000000006 | 0.014 | 0 | 0 |
| 3.900000000000007 | 0.013 | 0 | 0 |
| 3.904000000000007 | 0.013 | 0 | 0 |
| 3.908000000000007 | 0.013 | 0 | 0 |
| 3.912000000000007 | 0.012 | 0 | 0 |
| 3.916000000000007 | 0.012 | 0 | 0 |
| 3.920000000000007 | 0.012 | 0 | 0 |
| 3.924000000000007 | 0.012 | 0 | 0 |
| 3.928000000000007 | 0.011 | 0 | 0 |
| 3.932000000000007 | 0.011 | 0 | 0 |
| 3.936000000000007 | 0.011 | 0 | 0 |
| 3.940000000000007 | 0.011 | 0 | 0 |
| 3.944000000000007 | 0.01 | 0 | 0 |
| 3.948000000000007 | 0.01 | 0 | 0 |
| 3.952000000000007 | 0.01 | 0 | 0 |
| 3.956000000000007 | 0.01 | 0 | 0 |
| 3.960000000000007 | 0.009 | 0 | 0 |
| 3.964000000000007 | 0.009 | 0 | 0 |
| 3.968000000000007 | 0.009 | 0 | 0 |
| 3.972000000000007 | 0.009 | 0 | 0 |
| 3.976000000000007 | 0.009 | 0 | 0 |
| 3.980000000000007 | 0.008 | 0 | 0 |
| 3.984000000000007 | 0.008 | 0 | 0 |
| 3.988000000000007 | 0.008 | 0 | 0 |
| 3.992000000000007 | 0.008 | 0 | 0 |
| 3.996000000000007 | 0.008 | 0 | 0 |
| 4.000000000000006 | 0.007 | 0 | 0 |